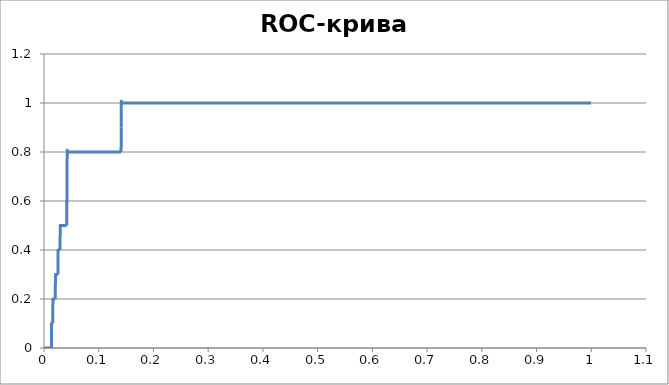
| Category | Чувствительность |
|---|---|
| 0.0 | 0 |
| 0.0002714440825190012 | 0 |
| 0.0005428881650380024 | 0 |
| 0.0008143322475570036 | 0 |
| 0.0010857763300760048 | 0 |
| 0.001357220412595006 | 0 |
| 0.0016286644951140072 | 0 |
| 0.0019001085776330084 | 0 |
| 0.0021715526601520097 | 0 |
| 0.002442996742671011 | 0 |
| 0.002714440825190012 | 0 |
| 0.0029858849077090133 | 0 |
| 0.0032573289902280145 | 0 |
| 0.0035287730727470157 | 0 |
| 0.003800217155266017 | 0 |
| 0.004071661237785018 | 0 |
| 0.004343105320304019 | 0 |
| 0.0046145494028230205 | 0 |
| 0.004885993485342022 | 0 |
| 0.005157437567861023 | 0 |
| 0.005428881650380024 | 0 |
| 0.005700325732899025 | 0 |
| 0.0059717698154180265 | 0 |
| 0.006243213897937028 | 0 |
| 0.006514657980456029 | 0 |
| 0.00678610206297503 | 0 |
| 0.007057546145494031 | 0 |
| 0.007328990228013033 | 0 |
| 0.007600434310532034 | 0 |
| 0.007871878393051035 | 0 |
| 0.008143322475570036 | 0 |
| 0.008414766558089037 | 0 |
| 0.008686210640608039 | 0 |
| 0.00895765472312704 | 0 |
| 0.009229098805646041 | 0 |
| 0.009500542888165042 | 0 |
| 0.009771986970684043 | 0 |
| 0.010043431053203045 | 0 |
| 0.010314875135722046 | 0 |
| 0.010586319218241047 | 0 |
| 0.010857763300760048 | 0 |
| 0.01112920738327905 | 0 |
| 0.01140065146579805 | 0 |
| 0.011672095548317052 | 0 |
| 0.011943539630836053 | 0 |
| 0.012214983713355054 | 0 |
| 0.012486427795874055 | 0 |
| 0.012757871878393057 | 0 |
| 0.013029315960912058 | 0 |
| 0.013300760043431059 | 0 |
| 0.01357220412595006 | 0 |
| 0.013843648208469062 | 0.1 |
| 0.013843648208469062 | 0.1 |
| 0.014115092290988063 | 0.1 |
| 0.014386536373507064 | 0.1 |
| 0.014657980456026065 | 0.1 |
| 0.014929424538545066 | 0.1 |
| 0.015200868621064068 | 0.1 |
| 0.015472312703583069 | 0.1 |
| 0.01574375678610207 | 0.1 |
| 0.01601520086862107 | 0.1 |
| 0.016286644951140072 | 0.2 |
| 0.016286644951140072 | 0.2 |
| 0.016558089033659074 | 0.2 |
| 0.016829533116178075 | 0.2 |
| 0.017100977198697076 | 0.2 |
| 0.017372421281216077 | 0.2 |
| 0.01764386536373508 | 0.2 |
| 0.01791530944625408 | 0.2 |
| 0.01818675352877308 | 0.2 |
| 0.018458197611292082 | 0.2 |
| 0.018729641693811083 | 0.2 |
| 0.019001085776330084 | 0.2 |
| 0.019272529858849086 | 0.2 |
| 0.019543973941368087 | 0.2 |
| 0.019815418023887088 | 0.2 |
| 0.02008686210640609 | 0.2 |
| 0.02035830618892509 | 0.2 |
| 0.02062975027144409 | 0.2 |
| 0.020901194353963093 | 0.3 |
| 0.020901194353963093 | 0.3 |
| 0.021172638436482094 | 0.3 |
| 0.021444082519001095 | 0.3 |
| 0.021715526601520097 | 0.3 |
| 0.021986970684039098 | 0.3 |
| 0.0222584147665581 | 0.3 |
| 0.0225298588490771 | 0.3 |
| 0.0228013029315961 | 0.3 |
| 0.023072747014115103 | 0.3 |
| 0.023344191096634104 | 0.3 |
| 0.023615635179153105 | 0.3 |
| 0.023887079261672106 | 0.3 |
| 0.024158523344191107 | 0.3 |
| 0.02442996742671011 | 0.3 |
| 0.02470141150922911 | 0.3 |
| 0.02497285559174811 | 0.3 |
| 0.025244299674267112 | 0.3 |
| 0.025515743756786113 | 0.3 |
| 0.025787187839305115 | 0.4 |
| 0.025787187839305115 | 0.4 |
| 0.026058631921824116 | 0.4 |
| 0.026330076004343117 | 0.4 |
| 0.026601520086862118 | 0.4 |
| 0.02687296416938112 | 0.4 |
| 0.02714440825190012 | 0.4 |
| 0.027415852334419122 | 0.4 |
| 0.027687296416938123 | 0.4 |
| 0.027958740499457124 | 0.4 |
| 0.028230184581976125 | 0.4 |
| 0.028501628664495127 | 0.4 |
| 0.028773072747014128 | 0.4 |
| 0.02904451682953313 | 0.4 |
| 0.02931596091205213 | 0.4 |
| 0.02958740499457113 | 0.5 |
| 0.02958740499457113 | 0.5 |
| 0.029858849077090133 | 0.5 |
| 0.030130293159609134 | 0.5 |
| 0.030401737242128135 | 0.5 |
| 0.030673181324647136 | 0.5 |
| 0.030944625407166138 | 0.5 |
| 0.03121606948968514 | 0.5 |
| 0.03148751357220414 | 0.5 |
| 0.03175895765472314 | 0.5 |
| 0.03203040173724214 | 0.5 |
| 0.032301845819761144 | 0.5 |
| 0.032573289902280145 | 0.5 |
| 0.032844733984799146 | 0.5 |
| 0.03311617806731815 | 0.5 |
| 0.03338762214983715 | 0.5 |
| 0.03365906623235615 | 0.5 |
| 0.03393051031487515 | 0.5 |
| 0.03420195439739415 | 0.5 |
| 0.03447339847991315 | 0.5 |
| 0.034744842562432154 | 0.5 |
| 0.035016286644951156 | 0.5 |
| 0.03528773072747016 | 0.5 |
| 0.03555917480998916 | 0.5 |
| 0.03583061889250816 | 0.5 |
| 0.03610206297502716 | 0.5 |
| 0.03637350705754616 | 0.5 |
| 0.03664495114006516 | 0.5 |
| 0.036916395222584164 | 0.5 |
| 0.037187839305103165 | 0.5 |
| 0.037459283387622166 | 0.5 |
| 0.03773072747014117 | 0.5 |
| 0.03800217155266017 | 0.5 |
| 0.03827361563517917 | 0.5 |
| 0.03854505971769817 | 0.5 |
| 0.03881650380021717 | 0.5 |
| 0.039087947882736174 | 0.5 |
| 0.039359391965255175 | 0.5 |
| 0.039630836047774176 | 0.5 |
| 0.03990228013029318 | 0.5 |
| 0.04017372421281218 | 0.5 |
| 0.04044516829533118 | 0.5 |
| 0.04071661237785018 | 0.5 |
| 0.04098805646036918 | 0.5 |
| 0.04125950054288818 | 0.5 |
| 0.041530944625407185 | 0.5 |
| 0.041802388707926186 | 0.6 |
| 0.041802388707926186 | 0.6 |
| 0.04207383279044519 | 0.7 |
| 0.04207383279044519 | 0.7 |
| 0.04234527687296419 | 0.8 |
| 0.04234527687296419 | 0.8 |
| 0.04261672095548319 | 0.8 |
| 0.04288816503800219 | 0.8 |
| 0.04315960912052119 | 0.8 |
| 0.04343105320304019 | 0.8 |
| 0.043702497285559194 | 0.8 |
| 0.043973941368078195 | 0.8 |
| 0.0442453854505972 | 0.8 |
| 0.0445168295331162 | 0.8 |
| 0.0447882736156352 | 0.8 |
| 0.0450597176981542 | 0.8 |
| 0.0453311617806732 | 0.8 |
| 0.0456026058631922 | 0.8 |
| 0.045874049945711204 | 0.8 |
| 0.046145494028230205 | 0.8 |
| 0.046416938110749206 | 0.8 |
| 0.04668838219326821 | 0.8 |
| 0.04695982627578721 | 0.8 |
| 0.04723127035830621 | 0.8 |
| 0.04750271444082521 | 0.8 |
| 0.04777415852334421 | 0.8 |
| 0.048045602605863214 | 0.8 |
| 0.048317046688382215 | 0.8 |
| 0.048588490770901216 | 0.8 |
| 0.04885993485342022 | 0.8 |
| 0.04913137893593922 | 0.8 |
| 0.04940282301845822 | 0.8 |
| 0.04967426710097722 | 0.8 |
| 0.04994571118349622 | 0.8 |
| 0.05021715526601522 | 0.8 |
| 0.050488599348534224 | 0.8 |
| 0.050760043431053226 | 0.8 |
| 0.05103148751357223 | 0.8 |
| 0.05130293159609123 | 0.8 |
| 0.05157437567861023 | 0.8 |
| 0.05184581976112923 | 0.8 |
| 0.05211726384364823 | 0.8 |
| 0.05238870792616723 | 0.8 |
| 0.052660152008686234 | 0.8 |
| 0.052931596091205235 | 0.8 |
| 0.053203040173724236 | 0.8 |
| 0.05347448425624324 | 0.8 |
| 0.05374592833876224 | 0.8 |
| 0.05401737242128124 | 0.8 |
| 0.05428881650380024 | 0.8 |
| 0.05456026058631924 | 0.8 |
| 0.054831704668838244 | 0.8 |
| 0.055103148751357245 | 0.8 |
| 0.055374592833876246 | 0.8 |
| 0.05564603691639525 | 0.8 |
| 0.05591748099891425 | 0.8 |
| 0.05618892508143325 | 0.8 |
| 0.05646036916395225 | 0.8 |
| 0.05673181324647125 | 0.8 |
| 0.05700325732899025 | 0.8 |
| 0.057274701411509255 | 0.8 |
| 0.057546145494028256 | 0.8 |
| 0.05781758957654726 | 0.8 |
| 0.05808903365906626 | 0.8 |
| 0.05836047774158526 | 0.8 |
| 0.05863192182410426 | 0.8 |
| 0.05890336590662326 | 0.8 |
| 0.05917480998914226 | 0.8 |
| 0.059446254071661264 | 0.8 |
| 0.059717698154180265 | 0.8 |
| 0.05998914223669927 | 0.8 |
| 0.06026058631921827 | 0.8 |
| 0.06053203040173727 | 0.8 |
| 0.06080347448425627 | 0.8 |
| 0.06107491856677527 | 0.8 |
| 0.06134636264929427 | 0.8 |
| 0.061617806731813274 | 0.8 |
| 0.061889250814332275 | 0.8 |
| 0.062160694896851276 | 0.8 |
| 0.06243213897937028 | 0.8 |
| 0.06270358306188928 | 0.8 |
| 0.06297502714440828 | 0.8 |
| 0.06324647122692728 | 0.8 |
| 0.06351791530944628 | 0.8 |
| 0.06378935939196528 | 0.8 |
| 0.06406080347448428 | 0.8 |
| 0.06433224755700329 | 0.8 |
| 0.06460369163952229 | 0.8 |
| 0.06487513572204129 | 0.8 |
| 0.06514657980456029 | 0.8 |
| 0.06541802388707929 | 0.8 |
| 0.06568946796959829 | 0.8 |
| 0.0659609120521173 | 0.8 |
| 0.0662323561346363 | 0.8 |
| 0.0665038002171553 | 0.8 |
| 0.0667752442996743 | 0.8 |
| 0.0670466883821933 | 0.8 |
| 0.0673181324647123 | 0.8 |
| 0.0675895765472313 | 0.8 |
| 0.0678610206297503 | 0.8 |
| 0.0681324647122693 | 0.8 |
| 0.0684039087947883 | 0.8 |
| 0.0686753528773073 | 0.8 |
| 0.0689467969598263 | 0.8 |
| 0.06921824104234531 | 0.8 |
| 0.06948968512486431 | 0.8 |
| 0.06976112920738331 | 0.8 |
| 0.07003257328990231 | 0.8 |
| 0.07030401737242131 | 0.8 |
| 0.07057546145494031 | 0.8 |
| 0.07084690553745931 | 0.8 |
| 0.07111834961997832 | 0.8 |
| 0.07138979370249732 | 0.8 |
| 0.07166123778501632 | 0.8 |
| 0.07193268186753532 | 0.8 |
| 0.07220412595005432 | 0.8 |
| 0.07247557003257332 | 0.8 |
| 0.07274701411509232 | 0.8 |
| 0.07301845819761132 | 0.8 |
| 0.07328990228013033 | 0.8 |
| 0.07356134636264933 | 0.8 |
| 0.07383279044516833 | 0.8 |
| 0.07410423452768733 | 0.8 |
| 0.07437567861020633 | 0.8 |
| 0.07464712269272533 | 0.8 |
| 0.07491856677524433 | 0.8 |
| 0.07519001085776333 | 0.8 |
| 0.07546145494028234 | 0.8 |
| 0.07573289902280134 | 0.8 |
| 0.07600434310532034 | 0.8 |
| 0.07627578718783934 | 0.8 |
| 0.07654723127035834 | 0.8 |
| 0.07681867535287734 | 0.8 |
| 0.07709011943539634 | 0.8 |
| 0.07736156351791534 | 0.8 |
| 0.07763300760043435 | 0.8 |
| 0.07790445168295335 | 0.8 |
| 0.07817589576547235 | 0.8 |
| 0.07844733984799135 | 0.8 |
| 0.07871878393051035 | 0.8 |
| 0.07899022801302935 | 0.8 |
| 0.07926167209554835 | 0.8 |
| 0.07953311617806735 | 0.8 |
| 0.07980456026058635 | 0.8 |
| 0.08007600434310536 | 0.8 |
| 0.08034744842562436 | 0.8 |
| 0.08061889250814336 | 0.8 |
| 0.08089033659066236 | 0.8 |
| 0.08116178067318136 | 0.8 |
| 0.08143322475570036 | 0.8 |
| 0.08170466883821936 | 0.8 |
| 0.08197611292073836 | 0.8 |
| 0.08224755700325737 | 0.8 |
| 0.08251900108577637 | 0.8 |
| 0.08279044516829537 | 0.8 |
| 0.08306188925081437 | 0.8 |
| 0.08333333333333337 | 0.8 |
| 0.08360477741585237 | 0.8 |
| 0.08387622149837137 | 0.8 |
| 0.08414766558089037 | 0.8 |
| 0.08441910966340938 | 0.8 |
| 0.08469055374592838 | 0.8 |
| 0.08496199782844738 | 0.8 |
| 0.08523344191096638 | 0.8 |
| 0.08550488599348538 | 0.8 |
| 0.08577633007600438 | 0.8 |
| 0.08604777415852338 | 0.8 |
| 0.08631921824104238 | 0.8 |
| 0.08659066232356138 | 0.8 |
| 0.08686210640608039 | 0.8 |
| 0.08713355048859939 | 0.8 |
| 0.08740499457111839 | 0.8 |
| 0.08767643865363739 | 0.8 |
| 0.08794788273615639 | 0.8 |
| 0.08821932681867539 | 0.8 |
| 0.0884907709011944 | 0.8 |
| 0.0887622149837134 | 0.8 |
| 0.0890336590662324 | 0.8 |
| 0.0893051031487514 | 0.8 |
| 0.0895765472312704 | 0.8 |
| 0.0898479913137894 | 0.8 |
| 0.0901194353963084 | 0.8 |
| 0.0903908794788274 | 0.8 |
| 0.0906623235613464 | 0.8 |
| 0.0909337676438654 | 0.8 |
| 0.0912052117263844 | 0.8 |
| 0.0914766558089034 | 0.8 |
| 0.09174809989142241 | 0.8 |
| 0.09201954397394141 | 0.8 |
| 0.09229098805646041 | 0.8 |
| 0.09256243213897941 | 0.8 |
| 0.09283387622149841 | 0.8 |
| 0.09310532030401741 | 0.8 |
| 0.09337676438653641 | 0.8 |
| 0.09364820846905542 | 0.8 |
| 0.09391965255157442 | 0.8 |
| 0.09419109663409342 | 0.8 |
| 0.09446254071661242 | 0.8 |
| 0.09473398479913142 | 0.8 |
| 0.09500542888165042 | 0.8 |
| 0.09527687296416942 | 0.8 |
| 0.09554831704668842 | 0.8 |
| 0.09581976112920743 | 0.8 |
| 0.09609120521172643 | 0.8 |
| 0.09636264929424543 | 0.8 |
| 0.09663409337676443 | 0.8 |
| 0.09690553745928343 | 0.8 |
| 0.09717698154180243 | 0.8 |
| 0.09744842562432143 | 0.8 |
| 0.09771986970684043 | 0.8 |
| 0.09799131378935944 | 0.8 |
| 0.09826275787187844 | 0.8 |
| 0.09853420195439744 | 0.8 |
| 0.09880564603691644 | 0.8 |
| 0.09907709011943544 | 0.8 |
| 0.09934853420195444 | 0.8 |
| 0.09961997828447344 | 0.8 |
| 0.09989142236699244 | 0.8 |
| 0.10016286644951145 | 0.8 |
| 0.10043431053203045 | 0.8 |
| 0.10070575461454945 | 0.8 |
| 0.10097719869706845 | 0.8 |
| 0.10124864277958745 | 0.8 |
| 0.10152008686210645 | 0.8 |
| 0.10179153094462545 | 0.8 |
| 0.10206297502714445 | 0.8 |
| 0.10233441910966345 | 0.8 |
| 0.10260586319218246 | 0.8 |
| 0.10287730727470146 | 0.8 |
| 0.10314875135722046 | 0.8 |
| 0.10342019543973946 | 0.8 |
| 0.10369163952225846 | 0.8 |
| 0.10396308360477746 | 0.8 |
| 0.10423452768729646 | 0.8 |
| 0.10450597176981546 | 0.8 |
| 0.10477741585233447 | 0.8 |
| 0.10504885993485347 | 0.8 |
| 0.10532030401737247 | 0.8 |
| 0.10559174809989147 | 0.8 |
| 0.10586319218241047 | 0.8 |
| 0.10613463626492947 | 0.8 |
| 0.10640608034744847 | 0.8 |
| 0.10667752442996747 | 0.8 |
| 0.10694896851248648 | 0.8 |
| 0.10722041259500548 | 0.8 |
| 0.10749185667752448 | 0.8 |
| 0.10776330076004348 | 0.8 |
| 0.10803474484256248 | 0.8 |
| 0.10830618892508148 | 0.8 |
| 0.10857763300760048 | 0.8 |
| 0.10884907709011948 | 0.8 |
| 0.10912052117263848 | 0.8 |
| 0.10939196525515749 | 0.8 |
| 0.10966340933767649 | 0.8 |
| 0.10993485342019549 | 0.8 |
| 0.11020629750271449 | 0.8 |
| 0.11047774158523349 | 0.8 |
| 0.11074918566775249 | 0.8 |
| 0.1110206297502715 | 0.8 |
| 0.1112920738327905 | 0.8 |
| 0.1115635179153095 | 0.8 |
| 0.1118349619978285 | 0.8 |
| 0.1121064060803475 | 0.8 |
| 0.1123778501628665 | 0.8 |
| 0.1126492942453855 | 0.8 |
| 0.1129207383279045 | 0.8 |
| 0.1131921824104235 | 0.8 |
| 0.1134636264929425 | 0.8 |
| 0.1137350705754615 | 0.8 |
| 0.1140065146579805 | 0.8 |
| 0.11427795874049951 | 0.8 |
| 0.11454940282301851 | 0.8 |
| 0.11482084690553751 | 0.8 |
| 0.11509229098805651 | 0.8 |
| 0.11536373507057551 | 0.8 |
| 0.11563517915309451 | 0.8 |
| 0.11590662323561352 | 0.8 |
| 0.11617806731813252 | 0.8 |
| 0.11644951140065152 | 0.8 |
| 0.11672095548317052 | 0.8 |
| 0.11699239956568952 | 0.8 |
| 0.11726384364820852 | 0.8 |
| 0.11753528773072752 | 0.8 |
| 0.11780673181324652 | 0.8 |
| 0.11807817589576552 | 0.8 |
| 0.11834961997828453 | 0.8 |
| 0.11862106406080353 | 0.8 |
| 0.11889250814332253 | 0.8 |
| 0.11916395222584153 | 0.8 |
| 0.11943539630836053 | 0.8 |
| 0.11970684039087953 | 0.8 |
| 0.11997828447339853 | 0.8 |
| 0.12024972855591753 | 0.8 |
| 0.12052117263843654 | 0.8 |
| 0.12079261672095554 | 0.8 |
| 0.12106406080347454 | 0.8 |
| 0.12133550488599354 | 0.8 |
| 0.12160694896851254 | 0.8 |
| 0.12187839305103154 | 0.8 |
| 0.12214983713355054 | 0.8 |
| 0.12242128121606954 | 0.8 |
| 0.12269272529858855 | 0.8 |
| 0.12296416938110755 | 0.8 |
| 0.12323561346362655 | 0.8 |
| 0.12350705754614555 | 0.8 |
| 0.12377850162866455 | 0.8 |
| 0.12404994571118355 | 0.8 |
| 0.12432138979370255 | 0.8 |
| 0.12459283387622155 | 0.8 |
| 0.12486427795874055 | 0.8 |
| 0.12513572204125945 | 0.8 |
| 0.12540716612377845 | 0.8 |
| 0.12567861020629745 | 0.8 |
| 0.12595005428881645 | 0.8 |
| 0.12622149837133545 | 0.8 |
| 0.12649294245385445 | 0.8 |
| 0.12676438653637345 | 0.8 |
| 0.12703583061889245 | 0.8 |
| 0.12730727470141145 | 0.8 |
| 0.12757871878393046 | 0.8 |
| 0.12785016286644946 | 0.8 |
| 0.12812160694896846 | 0.8 |
| 0.12839305103148746 | 0.8 |
| 0.12866449511400646 | 0.8 |
| 0.12893593919652546 | 0.8 |
| 0.12920738327904446 | 0.8 |
| 0.12947882736156346 | 0.8 |
| 0.12975027144408247 | 0.8 |
| 0.13002171552660147 | 0.8 |
| 0.13029315960912047 | 0.8 |
| 0.13056460369163947 | 0.8 |
| 0.13083604777415847 | 0.8 |
| 0.13110749185667747 | 0.8 |
| 0.13137893593919647 | 0.8 |
| 0.13165038002171547 | 0.8 |
| 0.13192182410423448 | 0.8 |
| 0.13219326818675348 | 0.8 |
| 0.13246471226927248 | 0.8 |
| 0.13273615635179148 | 0.8 |
| 0.13300760043431048 | 0.8 |
| 0.13327904451682948 | 0.8 |
| 0.13355048859934848 | 0.8 |
| 0.13382193268186748 | 0.8 |
| 0.13409337676438648 | 0.8 |
| 0.13436482084690549 | 0.8 |
| 0.1346362649294245 | 0.8 |
| 0.1349077090119435 | 0.8 |
| 0.1351791530944625 | 0.8 |
| 0.1354505971769815 | 0.8 |
| 0.1357220412595005 | 0.8 |
| 0.1359934853420195 | 0.8 |
| 0.1362649294245385 | 0.8 |
| 0.1365363735070575 | 0.8 |
| 0.1368078175895765 | 0.8 |
| 0.1370792616720955 | 0.8 |
| 0.1373507057546145 | 0.8 |
| 0.1376221498371335 | 0.8 |
| 0.1378935939196525 | 0.8 |
| 0.1381650380021715 | 0.8 |
| 0.1384364820846905 | 0.8 |
| 0.1387079261672095 | 0.8 |
| 0.1389793702497285 | 0.8 |
| 0.1392508143322475 | 0.8 |
| 0.1395222584147665 | 0.8 |
| 0.1397937024972855 | 0.8 |
| 0.1400651465798045 | 0.8 |
| 0.1403365906623235 | 0.8 |
| 0.1406080347448425 | 0.8 |
| 0.14087947882736152 | 0.8 |
| 0.14115092290988052 | 0.9 |
| 0.14115092290988052 | 1 |
| 0.14115092290988052 | 1 |
| 0.14142236699239952 | 1 |
| 0.14169381107491852 | 1 |
| 0.14196525515743752 | 1 |
| 0.14223669923995652 | 1 |
| 0.14250814332247552 | 1 |
| 0.14277958740499452 | 1 |
| 0.14305103148751352 | 1 |
| 0.14332247557003253 | 1 |
| 0.14359391965255153 | 1 |
| 0.14386536373507053 | 1 |
| 0.14413680781758953 | 1 |
| 0.14440825190010853 | 1 |
| 0.14467969598262753 | 1 |
| 0.14495114006514653 | 1 |
| 0.14522258414766553 | 1 |
| 0.14549402823018454 | 1 |
| 0.14576547231270354 | 1 |
| 0.14603691639522254 | 1 |
| 0.14630836047774154 | 1 |
| 0.14657980456026054 | 1 |
| 0.14685124864277954 | 1 |
| 0.14712269272529854 | 1 |
| 0.14739413680781754 | 1 |
| 0.14766558089033655 | 1 |
| 0.14793702497285555 | 1 |
| 0.14820846905537455 | 1 |
| 0.14847991313789355 | 1 |
| 0.14875135722041255 | 1 |
| 0.14902280130293155 | 1 |
| 0.14929424538545055 | 1 |
| 0.14956568946796955 | 1 |
| 0.14983713355048855 | 1 |
| 0.15010857763300756 | 1 |
| 0.15038002171552656 | 1 |
| 0.15065146579804556 | 1 |
| 0.15092290988056456 | 1 |
| 0.15119435396308356 | 1 |
| 0.15146579804560256 | 1 |
| 0.15173724212812156 | 1 |
| 0.15200868621064056 | 1 |
| 0.15228013029315957 | 1 |
| 0.15255157437567857 | 1 |
| 0.15282301845819757 | 1 |
| 0.15309446254071657 | 1 |
| 0.15336590662323557 | 1 |
| 0.15363735070575457 | 1 |
| 0.15390879478827357 | 1 |
| 0.15418023887079257 | 1 |
| 0.15445168295331158 | 1 |
| 0.15472312703583058 | 1 |
| 0.15499457111834958 | 1 |
| 0.15526601520086858 | 1 |
| 0.15553745928338758 | 1 |
| 0.15580890336590658 | 1 |
| 0.15608034744842558 | 1 |
| 0.15635179153094458 | 1 |
| 0.15662323561346359 | 1 |
| 0.1568946796959826 | 1 |
| 0.1571661237785016 | 1 |
| 0.1574375678610206 | 1 |
| 0.1577090119435396 | 1 |
| 0.1579804560260586 | 1 |
| 0.1582519001085776 | 1 |
| 0.1585233441910966 | 1 |
| 0.1587947882736156 | 1 |
| 0.1590662323561346 | 1 |
| 0.1593376764386536 | 1 |
| 0.1596091205211726 | 1 |
| 0.1598805646036916 | 1 |
| 0.1601520086862106 | 1 |
| 0.1604234527687296 | 1 |
| 0.1606948968512486 | 1 |
| 0.1609663409337676 | 1 |
| 0.1612377850162866 | 1 |
| 0.1615092290988056 | 1 |
| 0.1617806731813246 | 1 |
| 0.1620521172638436 | 1 |
| 0.1623235613463626 | 1 |
| 0.1625950054288816 | 1 |
| 0.1628664495114006 | 1 |
| 0.16313789359391961 | 1 |
| 0.16340933767643862 | 1 |
| 0.16368078175895762 | 1 |
| 0.16395222584147662 | 1 |
| 0.16422366992399562 | 1 |
| 0.16449511400651462 | 1 |
| 0.16476655808903362 | 1 |
| 0.16503800217155262 | 1 |
| 0.16530944625407162 | 1 |
| 0.16558089033659062 | 1 |
| 0.16585233441910963 | 1 |
| 0.16612377850162863 | 1 |
| 0.16639522258414763 | 1 |
| 0.16666666666666663 | 1 |
| 0.16693811074918563 | 1 |
| 0.16720955483170463 | 1 |
| 0.16748099891422363 | 1 |
| 0.16775244299674263 | 1 |
| 0.16802388707926164 | 1 |
| 0.16829533116178064 | 1 |
| 0.16856677524429964 | 1 |
| 0.16883821932681864 | 1 |
| 0.16910966340933764 | 1 |
| 0.16938110749185664 | 1 |
| 0.16965255157437564 | 1 |
| 0.16992399565689464 | 1 |
| 0.17019543973941365 | 1 |
| 0.17046688382193265 | 1 |
| 0.17073832790445165 | 1 |
| 0.17100977198697065 | 1 |
| 0.17128121606948965 | 1 |
| 0.17155266015200865 | 1 |
| 0.17182410423452765 | 1 |
| 0.17209554831704665 | 1 |
| 0.17236699239956565 | 1 |
| 0.17263843648208466 | 1 |
| 0.17290988056460366 | 1 |
| 0.17318132464712266 | 1 |
| 0.17345276872964166 | 1 |
| 0.17372421281216066 | 1 |
| 0.17399565689467966 | 1 |
| 0.17426710097719866 | 1 |
| 0.17453854505971766 | 1 |
| 0.17480998914223667 | 1 |
| 0.17508143322475567 | 1 |
| 0.17535287730727467 | 1 |
| 0.17562432138979367 | 1 |
| 0.17589576547231267 | 1 |
| 0.17616720955483167 | 1 |
| 0.17643865363735067 | 1 |
| 0.17671009771986967 | 1 |
| 0.17698154180238868 | 1 |
| 0.17725298588490768 | 1 |
| 0.17752442996742668 | 1 |
| 0.17779587404994568 | 1 |
| 0.17806731813246468 | 1 |
| 0.17833876221498368 | 1 |
| 0.17861020629750268 | 1 |
| 0.17888165038002168 | 1 |
| 0.17915309446254069 | 1 |
| 0.1794245385450597 | 1 |
| 0.1796959826275787 | 1 |
| 0.1799674267100977 | 1 |
| 0.1802388707926167 | 1 |
| 0.1805103148751357 | 1 |
| 0.1807817589576547 | 1 |
| 0.1810532030401737 | 1 |
| 0.1813246471226927 | 1 |
| 0.1815960912052117 | 1 |
| 0.1818675352877307 | 1 |
| 0.1821389793702497 | 1 |
| 0.1824104234527687 | 1 |
| 0.1826818675352877 | 1 |
| 0.1829533116178067 | 1 |
| 0.1832247557003257 | 1 |
| 0.1834961997828447 | 1 |
| 0.1837676438653637 | 1 |
| 0.1840390879478827 | 1 |
| 0.1843105320304017 | 1 |
| 0.1845819761129207 | 1 |
| 0.1848534201954397 | 1 |
| 0.1851248642779587 | 1 |
| 0.1853963083604777 | 1 |
| 0.18566775244299671 | 1 |
| 0.18593919652551572 | 1 |
| 0.18621064060803472 | 1 |
| 0.18648208469055372 | 1 |
| 0.18675352877307272 | 1 |
| 0.18702497285559172 | 1 |
| 0.18729641693811072 | 1 |
| 0.18756786102062972 | 1 |
| 0.18783930510314872 | 1 |
| 0.18811074918566772 | 1 |
| 0.18838219326818673 | 1 |
| 0.18865363735070573 | 1 |
| 0.18892508143322473 | 1 |
| 0.18919652551574373 | 1 |
| 0.18946796959826273 | 1 |
| 0.18973941368078173 | 1 |
| 0.19001085776330073 | 1 |
| 0.19028230184581973 | 1 |
| 0.19055374592833874 | 1 |
| 0.19082519001085774 | 1 |
| 0.19109663409337674 | 1 |
| 0.19136807817589574 | 1 |
| 0.19163952225841474 | 1 |
| 0.19191096634093374 | 1 |
| 0.19218241042345274 | 1 |
| 0.19245385450597174 | 1 |
| 0.19272529858849075 | 1 |
| 0.19299674267100975 | 1 |
| 0.19326818675352875 | 1 |
| 0.19353963083604775 | 1 |
| 0.19381107491856675 | 1 |
| 0.19408251900108575 | 1 |
| 0.19435396308360475 | 1 |
| 0.19462540716612375 | 1 |
| 0.19489685124864276 | 1 |
| 0.19516829533116176 | 1 |
| 0.19543973941368076 | 1 |
| 0.19571118349619976 | 1 |
| 0.19598262757871876 | 1 |
| 0.19625407166123776 | 1 |
| 0.19652551574375676 | 1 |
| 0.19679695982627576 | 1 |
| 0.19706840390879476 | 1 |
| 0.19733984799131377 | 1 |
| 0.19761129207383277 | 1 |
| 0.19788273615635177 | 1 |
| 0.19815418023887077 | 1 |
| 0.19842562432138977 | 1 |
| 0.19869706840390877 | 1 |
| 0.19896851248642777 | 1 |
| 0.19923995656894677 | 1 |
| 0.19951140065146578 | 1 |
| 0.19978284473398478 | 1 |
| 0.20005428881650378 | 1 |
| 0.20032573289902278 | 1 |
| 0.20059717698154178 | 1 |
| 0.20086862106406078 | 1 |
| 0.20114006514657978 | 1 |
| 0.20141150922909878 | 1 |
| 0.20168295331161779 | 1 |
| 0.2019543973941368 | 1 |
| 0.2022258414766558 | 1 |
| 0.2024972855591748 | 1 |
| 0.2027687296416938 | 1 |
| 0.2030401737242128 | 1 |
| 0.2033116178067318 | 1 |
| 0.2035830618892508 | 1 |
| 0.2038545059717698 | 1 |
| 0.2041259500542888 | 1 |
| 0.2043973941368078 | 1 |
| 0.2046688382193268 | 1 |
| 0.2049402823018458 | 1 |
| 0.2052117263843648 | 1 |
| 0.2054831704668838 | 1 |
| 0.2057546145494028 | 1 |
| 0.2060260586319218 | 1 |
| 0.2062975027144408 | 1 |
| 0.2065689467969598 | 1 |
| 0.2068403908794788 | 1 |
| 0.2071118349619978 | 1 |
| 0.2073832790445168 | 1 |
| 0.2076547231270358 | 1 |
| 0.2079261672095548 | 1 |
| 0.20819761129207381 | 1 |
| 0.20846905537459282 | 1 |
| 0.20874049945711182 | 1 |
| 0.20901194353963082 | 1 |
| 0.20928338762214982 | 1 |
| 0.20955483170466882 | 1 |
| 0.20982627578718782 | 1 |
| 0.21009771986970682 | 1 |
| 0.21036916395222582 | 1 |
| 0.21064060803474483 | 1 |
| 0.21091205211726383 | 1 |
| 0.21118349619978283 | 1 |
| 0.21145494028230183 | 1 |
| 0.21172638436482083 | 1 |
| 0.21199782844733983 | 1 |
| 0.21226927252985883 | 1 |
| 0.21254071661237783 | 1 |
| 0.21281216069489683 | 1 |
| 0.21308360477741584 | 1 |
| 0.21335504885993484 | 1 |
| 0.21362649294245384 | 1 |
| 0.21389793702497284 | 1 |
| 0.21416938110749184 | 1 |
| 0.21444082519001084 | 1 |
| 0.21471226927252984 | 1 |
| 0.21498371335504884 | 1 |
| 0.21525515743756785 | 1 |
| 0.21552660152008685 | 1 |
| 0.21579804560260585 | 1 |
| 0.21606948968512485 | 1 |
| 0.21634093376764385 | 1 |
| 0.21661237785016285 | 1 |
| 0.21688382193268185 | 1 |
| 0.21715526601520085 | 1 |
| 0.21742671009771986 | 1 |
| 0.21769815418023886 | 1 |
| 0.21796959826275786 | 1 |
| 0.21824104234527686 | 1 |
| 0.21851248642779586 | 1 |
| 0.21878393051031486 | 1 |
| 0.21905537459283386 | 1 |
| 0.21932681867535286 | 1 |
| 0.21959826275787186 | 1 |
| 0.21986970684039087 | 1 |
| 0.22014115092290987 | 1 |
| 0.22041259500542887 | 1 |
| 0.22068403908794787 | 1 |
| 0.22095548317046687 | 1 |
| 0.22122692725298587 | 1 |
| 0.22149837133550487 | 1 |
| 0.22176981541802387 | 1 |
| 0.22204125950054288 | 1 |
| 0.22231270358306188 | 1 |
| 0.22258414766558088 | 1 |
| 0.22285559174809988 | 1 |
| 0.22312703583061888 | 1 |
| 0.22339847991313788 | 1 |
| 0.22366992399565688 | 1 |
| 0.22394136807817588 | 1 |
| 0.22421281216069489 | 1 |
| 0.2244842562432139 | 1 |
| 0.2247557003257329 | 1 |
| 0.2250271444082519 | 1 |
| 0.2252985884907709 | 1 |
| 0.2255700325732899 | 1 |
| 0.2258414766558089 | 1 |
| 0.2261129207383279 | 1 |
| 0.2263843648208469 | 1 |
| 0.2266558089033659 | 1 |
| 0.2269272529858849 | 1 |
| 0.2271986970684039 | 1 |
| 0.2274701411509229 | 1 |
| 0.2277415852334419 | 1 |
| 0.2280130293159609 | 1 |
| 0.2282844733984799 | 1 |
| 0.2285559174809989 | 1 |
| 0.2288273615635179 | 1 |
| 0.2290988056460369 | 1 |
| 0.2293702497285559 | 1 |
| 0.2296416938110749 | 1 |
| 0.2299131378935939 | 1 |
| 0.2301845819761129 | 1 |
| 0.2304560260586319 | 1 |
| 0.23072747014115091 | 1 |
| 0.23099891422366992 | 1 |
| 0.23127035830618892 | 1 |
| 0.23154180238870792 | 1 |
| 0.23181324647122692 | 1 |
| 0.23208469055374592 | 1 |
| 0.23235613463626492 | 1 |
| 0.23262757871878392 | 1 |
| 0.23289902280130292 | 1 |
| 0.23317046688382193 | 1 |
| 0.23344191096634093 | 1 |
| 0.23371335504885993 | 1 |
| 0.23398479913137893 | 1 |
| 0.23425624321389793 | 1 |
| 0.23452768729641693 | 1 |
| 0.23479913137893593 | 1 |
| 0.23507057546145493 | 1 |
| 0.23534201954397393 | 1 |
| 0.23561346362649294 | 1 |
| 0.23588490770901194 | 1 |
| 0.23615635179153094 | 1 |
| 0.23642779587404994 | 1 |
| 0.23669923995656894 | 1 |
| 0.23697068403908794 | 1 |
| 0.23724212812160694 | 1 |
| 0.23751357220412594 | 1 |
| 0.23778501628664495 | 1 |
| 0.23805646036916395 | 1 |
| 0.23832790445168295 | 1 |
| 0.23859934853420195 | 1 |
| 0.23887079261672095 | 1 |
| 0.23914223669923995 | 1 |
| 0.23941368078175895 | 1 |
| 0.23968512486427795 | 1 |
| 0.23995656894679696 | 1 |
| 0.24022801302931596 | 1 |
| 0.24049945711183496 | 1 |
| 0.24077090119435396 | 1 |
| 0.24104234527687296 | 1 |
| 0.24131378935939196 | 1 |
| 0.24158523344191096 | 1 |
| 0.24185667752442996 | 1 |
| 0.24212812160694897 | 1 |
| 0.24239956568946797 | 1 |
| 0.24267100977198697 | 1 |
| 0.24294245385450597 | 1 |
| 0.24321389793702497 | 1 |
| 0.24348534201954397 | 1 |
| 0.24375678610206297 | 1 |
| 0.24402823018458197 | 1 |
| 0.24429967426710097 | 1 |
| 0.24457111834961998 | 1 |
| 0.24484256243213898 | 1 |
| 0.24511400651465798 | 1 |
| 0.24538545059717698 | 1 |
| 0.24565689467969598 | 1 |
| 0.24592833876221498 | 1 |
| 0.24619978284473398 | 1 |
| 0.24647122692725298 | 1 |
| 0.24674267100977199 | 1 |
| 0.247014115092291 | 1 |
| 0.24728555917481 | 1 |
| 0.247557003257329 | 1 |
| 0.247828447339848 | 1 |
| 0.248099891422367 | 1 |
| 0.248371335504886 | 1 |
| 0.248642779587405 | 1 |
| 0.248914223669924 | 1 |
| 0.249185667752443 | 1 |
| 0.249457111834962 | 1 |
| 0.249728555917481 | 1 |
| 0.25 | 1 |
| 0.250271444082519 | 1 |
| 0.250542888165038 | 1 |
| 0.250814332247557 | 1 |
| 0.251085776330076 | 1 |
| 0.251357220412595 | 1 |
| 0.251628664495114 | 1 |
| 0.251900108577633 | 1 |
| 0.252171552660152 | 1 |
| 0.252442996742671 | 1 |
| 0.25271444082519 | 1 |
| 0.252985884907709 | 1 |
| 0.253257328990228 | 1 |
| 0.253528773072747 | 1 |
| 0.253800217155266 | 1 |
| 0.254071661237785 | 1 |
| 0.254343105320304 | 1 |
| 0.254614549402823 | 1 |
| 0.254885993485342 | 1 |
| 0.255157437567861 | 1 |
| 0.25542888165038 | 1 |
| 0.255700325732899 | 1 |
| 0.255971769815418 | 1 |
| 0.256243213897937 | 1 |
| 0.25651465798045603 | 1 |
| 0.25678610206297503 | 1 |
| 0.25705754614549403 | 1 |
| 0.25732899022801303 | 1 |
| 0.25760043431053203 | 1 |
| 0.25787187839305103 | 1 |
| 0.25814332247557004 | 1 |
| 0.25841476655808904 | 1 |
| 0.25868621064060804 | 1 |
| 0.25895765472312704 | 1 |
| 0.25922909880564604 | 1 |
| 0.25950054288816504 | 1 |
| 0.25977198697068404 | 1 |
| 0.26004343105320304 | 1 |
| 0.26031487513572205 | 1 |
| 0.26058631921824105 | 1 |
| 0.26085776330076005 | 1 |
| 0.26112920738327905 | 1 |
| 0.26140065146579805 | 1 |
| 0.26167209554831705 | 1 |
| 0.26194353963083605 | 1 |
| 0.26221498371335505 | 1 |
| 0.26248642779587406 | 1 |
| 0.26275787187839306 | 1 |
| 0.26302931596091206 | 1 |
| 0.26330076004343106 | 1 |
| 0.26357220412595006 | 1 |
| 0.26384364820846906 | 1 |
| 0.26411509229098806 | 1 |
| 0.26438653637350706 | 1 |
| 0.26465798045602607 | 1 |
| 0.26492942453854507 | 1 |
| 0.26520086862106407 | 1 |
| 0.26547231270358307 | 1 |
| 0.26574375678610207 | 1 |
| 0.26601520086862107 | 1 |
| 0.2662866449511401 | 1 |
| 0.2665580890336591 | 1 |
| 0.2668295331161781 | 1 |
| 0.2671009771986971 | 1 |
| 0.2673724212812161 | 1 |
| 0.2676438653637351 | 1 |
| 0.2679153094462541 | 1 |
| 0.2681867535287731 | 1 |
| 0.2684581976112921 | 1 |
| 0.2687296416938111 | 1 |
| 0.2690010857763301 | 1 |
| 0.2692725298588491 | 1 |
| 0.2695439739413681 | 1 |
| 0.2698154180238871 | 1 |
| 0.2700868621064061 | 1 |
| 0.2703583061889251 | 1 |
| 0.2706297502714441 | 1 |
| 0.2709011943539631 | 1 |
| 0.2711726384364821 | 1 |
| 0.2714440825190011 | 1 |
| 0.2717155266015201 | 1 |
| 0.2719869706840391 | 1 |
| 0.2722584147665581 | 1 |
| 0.2725298588490771 | 1 |
| 0.2728013029315961 | 1 |
| 0.2730727470141151 | 1 |
| 0.2733441910966341 | 1 |
| 0.2736156351791531 | 1 |
| 0.2738870792616721 | 1 |
| 0.2741585233441911 | 1 |
| 0.2744299674267101 | 1 |
| 0.2747014115092291 | 1 |
| 0.2749728555917481 | 1 |
| 0.2752442996742671 | 1 |
| 0.2755157437567861 | 1 |
| 0.2757871878393051 | 1 |
| 0.2760586319218241 | 1 |
| 0.2763300760043431 | 1 |
| 0.2766015200868621 | 1 |
| 0.2768729641693811 | 1 |
| 0.2771444082519001 | 1 |
| 0.2774158523344191 | 1 |
| 0.2776872964169381 | 1 |
| 0.2779587404994571 | 1 |
| 0.2782301845819761 | 1 |
| 0.2785016286644951 | 1 |
| 0.27877307274701413 | 1 |
| 0.27904451682953313 | 1 |
| 0.27931596091205213 | 1 |
| 0.27958740499457113 | 1 |
| 0.27985884907709013 | 1 |
| 0.28013029315960913 | 1 |
| 0.28040173724212814 | 1 |
| 0.28067318132464714 | 1 |
| 0.28094462540716614 | 1 |
| 0.28121606948968514 | 1 |
| 0.28148751357220414 | 1 |
| 0.28175895765472314 | 1 |
| 0.28203040173724214 | 1 |
| 0.28230184581976114 | 1 |
| 0.28257328990228014 | 1 |
| 0.28284473398479915 | 1 |
| 0.28311617806731815 | 1 |
| 0.28338762214983715 | 1 |
| 0.28365906623235615 | 1 |
| 0.28393051031487515 | 1 |
| 0.28420195439739415 | 1 |
| 0.28447339847991315 | 1 |
| 0.28474484256243215 | 1 |
| 0.28501628664495116 | 1 |
| 0.28528773072747016 | 1 |
| 0.28555917480998916 | 1 |
| 0.28583061889250816 | 1 |
| 0.28610206297502716 | 1 |
| 0.28637350705754616 | 1 |
| 0.28664495114006516 | 1 |
| 0.28691639522258416 | 1 |
| 0.28718783930510317 | 1 |
| 0.28745928338762217 | 1 |
| 0.28773072747014117 | 1 |
| 0.28800217155266017 | 1 |
| 0.28827361563517917 | 1 |
| 0.28854505971769817 | 1 |
| 0.2888165038002172 | 1 |
| 0.2890879478827362 | 1 |
| 0.2893593919652552 | 1 |
| 0.2896308360477742 | 1 |
| 0.2899022801302932 | 1 |
| 0.2901737242128122 | 1 |
| 0.2904451682953312 | 1 |
| 0.2907166123778502 | 1 |
| 0.2909880564603692 | 1 |
| 0.2912595005428882 | 1 |
| 0.2915309446254072 | 1 |
| 0.2918023887079262 | 1 |
| 0.2920738327904452 | 1 |
| 0.2923452768729642 | 1 |
| 0.2926167209554832 | 1 |
| 0.2928881650380022 | 1 |
| 0.2931596091205212 | 1 |
| 0.2934310532030402 | 1 |
| 0.2937024972855592 | 1 |
| 0.2939739413680782 | 1 |
| 0.2942453854505972 | 1 |
| 0.2945168295331162 | 1 |
| 0.2947882736156352 | 1 |
| 0.2950597176981542 | 1 |
| 0.2953311617806732 | 1 |
| 0.2956026058631922 | 1 |
| 0.2958740499457112 | 1 |
| 0.2961454940282302 | 1 |
| 0.2964169381107492 | 1 |
| 0.2966883821932682 | 1 |
| 0.2969598262757872 | 1 |
| 0.2972312703583062 | 1 |
| 0.2975027144408252 | 1 |
| 0.2977741585233442 | 1 |
| 0.2980456026058632 | 1 |
| 0.2983170466883822 | 1 |
| 0.2985884907709012 | 1 |
| 0.2988599348534202 | 1 |
| 0.2991313789359392 | 1 |
| 0.2994028230184582 | 1 |
| 0.2996742671009772 | 1 |
| 0.2999457111834962 | 1 |
| 0.3002171552660152 | 1 |
| 0.3004885993485342 | 1 |
| 0.3007600434310532 | 1 |
| 0.3010314875135722 | 1 |
| 0.30130293159609123 | 1 |
| 0.30157437567861023 | 1 |
| 0.30184581976112923 | 1 |
| 0.30211726384364823 | 1 |
| 0.30238870792616723 | 1 |
| 0.30266015200868623 | 1 |
| 0.30293159609120524 | 1 |
| 0.30320304017372424 | 1 |
| 0.30347448425624324 | 1 |
| 0.30374592833876224 | 1 |
| 0.30401737242128124 | 1 |
| 0.30428881650380024 | 1 |
| 0.30456026058631924 | 1 |
| 0.30483170466883824 | 1 |
| 0.30510314875135724 | 1 |
| 0.30537459283387625 | 1 |
| 0.30564603691639525 | 1 |
| 0.30591748099891425 | 1 |
| 0.30618892508143325 | 1 |
| 0.30646036916395225 | 1 |
| 0.30673181324647125 | 1 |
| 0.30700325732899025 | 1 |
| 0.30727470141150925 | 1 |
| 0.30754614549402826 | 1 |
| 0.30781758957654726 | 1 |
| 0.30808903365906626 | 1 |
| 0.30836047774158526 | 1 |
| 0.30863192182410426 | 1 |
| 0.30890336590662326 | 1 |
| 0.30917480998914226 | 1 |
| 0.30944625407166126 | 1 |
| 0.30971769815418027 | 1 |
| 0.30998914223669927 | 1 |
| 0.31026058631921827 | 1 |
| 0.31053203040173727 | 1 |
| 0.31080347448425627 | 1 |
| 0.31107491856677527 | 1 |
| 0.3113463626492943 | 1 |
| 0.3116178067318133 | 1 |
| 0.3118892508143323 | 1 |
| 0.3121606948968513 | 1 |
| 0.3124321389793703 | 1 |
| 0.3127035830618893 | 1 |
| 0.3129750271444083 | 1 |
| 0.3132464712269273 | 1 |
| 0.3135179153094463 | 1 |
| 0.3137893593919653 | 1 |
| 0.3140608034744843 | 1 |
| 0.3143322475570033 | 1 |
| 0.3146036916395223 | 1 |
| 0.3148751357220413 | 1 |
| 0.3151465798045603 | 1 |
| 0.3154180238870793 | 1 |
| 0.3156894679695983 | 1 |
| 0.3159609120521173 | 1 |
| 0.3162323561346363 | 1 |
| 0.3165038002171553 | 1 |
| 0.3167752442996743 | 1 |
| 0.3170466883821933 | 1 |
| 0.3173181324647123 | 1 |
| 0.3175895765472313 | 1 |
| 0.3178610206297503 | 1 |
| 0.3181324647122693 | 1 |
| 0.3184039087947883 | 1 |
| 0.3186753528773073 | 1 |
| 0.3189467969598263 | 1 |
| 0.3192182410423453 | 1 |
| 0.3194896851248643 | 1 |
| 0.3197611292073833 | 1 |
| 0.3200325732899023 | 1 |
| 0.3203040173724213 | 1 |
| 0.3205754614549403 | 1 |
| 0.3208469055374593 | 1 |
| 0.3211183496199783 | 1 |
| 0.3213897937024973 | 1 |
| 0.3216612377850163 | 1 |
| 0.3219326818675353 | 1 |
| 0.3222041259500543 | 1 |
| 0.3224755700325733 | 1 |
| 0.3227470141150923 | 1 |
| 0.3230184581976113 | 1 |
| 0.3232899022801303 | 1 |
| 0.3235613463626493 | 1 |
| 0.32383279044516833 | 1 |
| 0.32410423452768733 | 1 |
| 0.32437567861020633 | 1 |
| 0.32464712269272533 | 1 |
| 0.32491856677524433 | 1 |
| 0.32519001085776333 | 1 |
| 0.32546145494028234 | 1 |
| 0.32573289902280134 | 1 |
| 0.32600434310532034 | 1 |
| 0.32627578718783934 | 1 |
| 0.32654723127035834 | 1 |
| 0.32681867535287734 | 1 |
| 0.32709011943539634 | 1 |
| 0.32736156351791534 | 1 |
| 0.32763300760043435 | 1 |
| 0.32790445168295335 | 1 |
| 0.32817589576547235 | 1 |
| 0.32844733984799135 | 1 |
| 0.32871878393051035 | 1 |
| 0.32899022801302935 | 1 |
| 0.32926167209554835 | 1 |
| 0.32953311617806735 | 1 |
| 0.32980456026058635 | 1 |
| 0.33007600434310536 | 1 |
| 0.33034744842562436 | 1 |
| 0.33061889250814336 | 1 |
| 0.33089033659066236 | 1 |
| 0.33116178067318136 | 1 |
| 0.33143322475570036 | 1 |
| 0.33170466883821936 | 1 |
| 0.33197611292073836 | 1 |
| 0.33224755700325737 | 1 |
| 0.33251900108577637 | 1 |
| 0.33279044516829537 | 1 |
| 0.33306188925081437 | 1 |
| 0.33333333333333337 | 1 |
| 0.33360477741585237 | 1 |
| 0.3338762214983714 | 1 |
| 0.3341476655808904 | 1 |
| 0.3344191096634094 | 1 |
| 0.3346905537459284 | 1 |
| 0.3349619978284474 | 1 |
| 0.3352334419109664 | 1 |
| 0.3355048859934854 | 1 |
| 0.3357763300760044 | 1 |
| 0.3360477741585234 | 1 |
| 0.3363192182410424 | 1 |
| 0.3365906623235614 | 1 |
| 0.3368621064060804 | 1 |
| 0.3371335504885994 | 1 |
| 0.3374049945711184 | 1 |
| 0.3376764386536374 | 1 |
| 0.3379478827361564 | 1 |
| 0.3382193268186754 | 1 |
| 0.3384907709011944 | 1 |
| 0.3387622149837134 | 1 |
| 0.3390336590662324 | 1 |
| 0.3393051031487514 | 1 |
| 0.3395765472312704 | 1 |
| 0.3398479913137894 | 1 |
| 0.3401194353963084 | 1 |
| 0.3403908794788274 | 1 |
| 0.3406623235613464 | 1 |
| 0.3409337676438654 | 1 |
| 0.3412052117263844 | 1 |
| 0.3414766558089034 | 1 |
| 0.3417480998914224 | 1 |
| 0.3420195439739414 | 1 |
| 0.3422909880564604 | 1 |
| 0.3425624321389794 | 1 |
| 0.3428338762214984 | 1 |
| 0.3431053203040174 | 1 |
| 0.3433767643865364 | 1 |
| 0.3436482084690554 | 1 |
| 0.3439196525515744 | 1 |
| 0.3441910966340934 | 1 |
| 0.3444625407166124 | 1 |
| 0.3447339847991314 | 1 |
| 0.3450054288816504 | 1 |
| 0.3452768729641694 | 1 |
| 0.3455483170466884 | 1 |
| 0.3458197611292074 | 1 |
| 0.3460912052117264 | 1 |
| 0.34636264929424543 | 1 |
| 0.34663409337676443 | 1 |
| 0.34690553745928343 | 1 |
| 0.34717698154180243 | 1 |
| 0.34744842562432143 | 1 |
| 0.34771986970684043 | 1 |
| 0.34799131378935944 | 1 |
| 0.34826275787187844 | 1 |
| 0.34853420195439744 | 1 |
| 0.34880564603691644 | 1 |
| 0.34907709011943544 | 1 |
| 0.34934853420195444 | 1 |
| 0.34961997828447344 | 1 |
| 0.34989142236699244 | 1 |
| 0.35016286644951145 | 1 |
| 0.35043431053203045 | 1 |
| 0.35070575461454945 | 1 |
| 0.35097719869706845 | 1 |
| 0.35124864277958745 | 1 |
| 0.35152008686210645 | 1 |
| 0.35179153094462545 | 1 |
| 0.35206297502714445 | 1 |
| 0.35233441910966345 | 1 |
| 0.35260586319218246 | 1 |
| 0.35287730727470146 | 1 |
| 0.35314875135722046 | 1 |
| 0.35342019543973946 | 1 |
| 0.35369163952225846 | 1 |
| 0.35396308360477746 | 1 |
| 0.35423452768729646 | 1 |
| 0.35450597176981546 | 1 |
| 0.35477741585233447 | 1 |
| 0.35504885993485347 | 1 |
| 0.35532030401737247 | 1 |
| 0.35559174809989147 | 1 |
| 0.35586319218241047 | 1 |
| 0.35613463626492947 | 1 |
| 0.3564060803474485 | 1 |
| 0.3566775244299675 | 1 |
| 0.3569489685124865 | 1 |
| 0.3572204125950055 | 1 |
| 0.3574918566775245 | 1 |
| 0.3577633007600435 | 1 |
| 0.3580347448425625 | 1 |
| 0.3583061889250815 | 1 |
| 0.3585776330076005 | 1 |
| 0.3588490770901195 | 1 |
| 0.3591205211726385 | 1 |
| 0.3593919652551575 | 1 |
| 0.3596634093376765 | 1 |
| 0.3599348534201955 | 1 |
| 0.3602062975027145 | 1 |
| 0.3604777415852335 | 1 |
| 0.3607491856677525 | 1 |
| 0.3610206297502715 | 1 |
| 0.3612920738327905 | 1 |
| 0.3615635179153095 | 1 |
| 0.3618349619978285 | 1 |
| 0.3621064060803475 | 1 |
| 0.3623778501628665 | 1 |
| 0.3626492942453855 | 1 |
| 0.3629207383279045 | 1 |
| 0.3631921824104235 | 1 |
| 0.3634636264929425 | 1 |
| 0.3637350705754615 | 1 |
| 0.3640065146579805 | 1 |
| 0.3642779587404995 | 1 |
| 0.3645494028230185 | 1 |
| 0.3648208469055375 | 1 |
| 0.3650922909880565 | 1 |
| 0.3653637350705755 | 1 |
| 0.3656351791530945 | 1 |
| 0.3659066232356135 | 1 |
| 0.3661780673181325 | 1 |
| 0.3664495114006515 | 1 |
| 0.3667209554831705 | 1 |
| 0.3669923995656895 | 1 |
| 0.3672638436482085 | 1 |
| 0.3675352877307275 | 1 |
| 0.3678067318132465 | 1 |
| 0.3680781758957655 | 1 |
| 0.3683496199782845 | 1 |
| 0.3686210640608035 | 1 |
| 0.36889250814332253 | 1 |
| 0.36916395222584153 | 1 |
| 0.36943539630836053 | 1 |
| 0.36970684039087953 | 1 |
| 0.36997828447339853 | 1 |
| 0.37024972855591753 | 1 |
| 0.37052117263843654 | 1 |
| 0.37079261672095554 | 1 |
| 0.37106406080347454 | 1 |
| 0.37133550488599354 | 1 |
| 0.37160694896851254 | 1 |
| 0.37187839305103154 | 1 |
| 0.37214983713355054 | 1 |
| 0.37242128121606954 | 1 |
| 0.37269272529858855 | 1 |
| 0.37296416938110755 | 1 |
| 0.37323561346362655 | 1 |
| 0.37350705754614555 | 1 |
| 0.37377850162866455 | 1 |
| 0.37404994571118355 | 1 |
| 0.37432138979370255 | 1 |
| 0.37459283387622155 | 1 |
| 0.37486427795874055 | 1 |
| 0.37513572204125945 | 1 |
| 0.37540716612377845 | 1 |
| 0.37567861020629745 | 1 |
| 0.37595005428881645 | 1 |
| 0.37622149837133545 | 1 |
| 0.37649294245385445 | 1 |
| 0.37676438653637345 | 1 |
| 0.37703583061889245 | 1 |
| 0.37730727470141145 | 1 |
| 0.37757871878393046 | 1 |
| 0.37785016286644946 | 1 |
| 0.37812160694896846 | 1 |
| 0.37839305103148746 | 1 |
| 0.37866449511400646 | 1 |
| 0.37893593919652546 | 1 |
| 0.37920738327904446 | 1 |
| 0.37947882736156346 | 1 |
| 0.37975027144408247 | 1 |
| 0.38002171552660147 | 1 |
| 0.38029315960912047 | 1 |
| 0.38056460369163947 | 1 |
| 0.38083604777415847 | 1 |
| 0.38110749185667747 | 1 |
| 0.3813789359391965 | 1 |
| 0.3816503800217155 | 1 |
| 0.3819218241042345 | 1 |
| 0.3821932681867535 | 1 |
| 0.3824647122692725 | 1 |
| 0.3827361563517915 | 1 |
| 0.3830076004343105 | 1 |
| 0.3832790445168295 | 1 |
| 0.3835504885993485 | 1 |
| 0.3838219326818675 | 1 |
| 0.3840933767643865 | 1 |
| 0.3843648208469055 | 1 |
| 0.3846362649294245 | 1 |
| 0.3849077090119435 | 1 |
| 0.3851791530944625 | 1 |
| 0.3854505971769815 | 1 |
| 0.3857220412595005 | 1 |
| 0.3859934853420195 | 1 |
| 0.3862649294245385 | 1 |
| 0.3865363735070575 | 1 |
| 0.3868078175895765 | 1 |
| 0.3870792616720955 | 1 |
| 0.3873507057546145 | 1 |
| 0.3876221498371335 | 1 |
| 0.3878935939196525 | 1 |
| 0.3881650380021715 | 1 |
| 0.3884364820846905 | 1 |
| 0.3887079261672095 | 1 |
| 0.3889793702497285 | 1 |
| 0.3892508143322475 | 1 |
| 0.3895222584147665 | 1 |
| 0.3897937024972855 | 1 |
| 0.3900651465798045 | 1 |
| 0.3903365906623235 | 1 |
| 0.3906080347448425 | 1 |
| 0.3908794788273615 | 1 |
| 0.3911509229098805 | 1 |
| 0.3914223669923995 | 1 |
| 0.3916938110749185 | 1 |
| 0.3919652551574375 | 1 |
| 0.3922366992399565 | 1 |
| 0.3925081433224755 | 1 |
| 0.3927795874049945 | 1 |
| 0.3930510314875135 | 1 |
| 0.3933224755700325 | 1 |
| 0.3935939196525515 | 1 |
| 0.39386536373507053 | 1 |
| 0.39413680781758953 | 1 |
| 0.39440825190010853 | 1 |
| 0.39467969598262753 | 1 |
| 0.39495114006514653 | 1 |
| 0.39522258414766553 | 1 |
| 0.39549402823018454 | 1 |
| 0.39576547231270354 | 1 |
| 0.39603691639522254 | 1 |
| 0.39630836047774154 | 1 |
| 0.39657980456026054 | 1 |
| 0.39685124864277954 | 1 |
| 0.39712269272529854 | 1 |
| 0.39739413680781754 | 1 |
| 0.39766558089033655 | 1 |
| 0.39793702497285555 | 1 |
| 0.39820846905537455 | 1 |
| 0.39847991313789355 | 1 |
| 0.39875135722041255 | 1 |
| 0.39902280130293155 | 1 |
| 0.39929424538545055 | 1 |
| 0.39956568946796955 | 1 |
| 0.39983713355048855 | 1 |
| 0.40010857763300756 | 1 |
| 0.40038002171552656 | 1 |
| 0.40065146579804556 | 1 |
| 0.40092290988056456 | 1 |
| 0.40119435396308356 | 1 |
| 0.40146579804560256 | 1 |
| 0.40173724212812156 | 1 |
| 0.40200868621064056 | 1 |
| 0.40228013029315957 | 1 |
| 0.40255157437567857 | 1 |
| 0.40282301845819757 | 1 |
| 0.40309446254071657 | 1 |
| 0.40336590662323557 | 1 |
| 0.40363735070575457 | 1 |
| 0.4039087947882736 | 1 |
| 0.4041802388707926 | 1 |
| 0.4044516829533116 | 1 |
| 0.4047231270358306 | 1 |
| 0.4049945711183496 | 1 |
| 0.4052660152008686 | 1 |
| 0.4055374592833876 | 1 |
| 0.4058089033659066 | 1 |
| 0.4060803474484256 | 1 |
| 0.4063517915309446 | 1 |
| 0.4066232356134636 | 1 |
| 0.4068946796959826 | 1 |
| 0.4071661237785016 | 1 |
| 0.4074375678610206 | 1 |
| 0.4077090119435396 | 1 |
| 0.4079804560260586 | 1 |
| 0.4082519001085776 | 1 |
| 0.4085233441910966 | 1 |
| 0.4087947882736156 | 1 |
| 0.4090662323561346 | 1 |
| 0.4093376764386536 | 1 |
| 0.4096091205211726 | 1 |
| 0.4098805646036916 | 1 |
| 0.4101520086862106 | 1 |
| 0.4104234527687296 | 1 |
| 0.4106948968512486 | 1 |
| 0.4109663409337676 | 1 |
| 0.4112377850162866 | 1 |
| 0.4115092290988056 | 1 |
| 0.4117806731813246 | 1 |
| 0.4120521172638436 | 1 |
| 0.4123235613463626 | 1 |
| 0.4125950054288816 | 1 |
| 0.4128664495114006 | 1 |
| 0.4131378935939196 | 1 |
| 0.4134093376764386 | 1 |
| 0.4136807817589576 | 1 |
| 0.4139522258414766 | 1 |
| 0.4142236699239956 | 1 |
| 0.4144951140065146 | 1 |
| 0.4147665580890336 | 1 |
| 0.4150380021715526 | 1 |
| 0.4153094462540716 | 1 |
| 0.4155808903365906 | 1 |
| 0.4158523344191096 | 1 |
| 0.4161237785016286 | 1 |
| 0.41639522258414763 | 1 |
| 0.41666666666666663 | 1 |
| 0.41693811074918563 | 1 |
| 0.41720955483170463 | 1 |
| 0.41748099891422363 | 1 |
| 0.41775244299674263 | 1 |
| 0.41802388707926164 | 1 |
| 0.41829533116178064 | 1 |
| 0.41856677524429964 | 1 |
| 0.41883821932681864 | 1 |
| 0.41910966340933764 | 1 |
| 0.41938110749185664 | 1 |
| 0.41965255157437564 | 1 |
| 0.41992399565689464 | 1 |
| 0.42019543973941365 | 1 |
| 0.42046688382193265 | 1 |
| 0.42073832790445165 | 1 |
| 0.42100977198697065 | 1 |
| 0.42128121606948965 | 1 |
| 0.42155266015200865 | 1 |
| 0.42182410423452765 | 1 |
| 0.42209554831704665 | 1 |
| 0.42236699239956565 | 1 |
| 0.42263843648208466 | 1 |
| 0.42290988056460366 | 1 |
| 0.42318132464712266 | 1 |
| 0.42345276872964166 | 1 |
| 0.42372421281216066 | 1 |
| 0.42399565689467966 | 1 |
| 0.42426710097719866 | 1 |
| 0.42453854505971766 | 1 |
| 0.42480998914223667 | 1 |
| 0.42508143322475567 | 1 |
| 0.42535287730727467 | 1 |
| 0.42562432138979367 | 1 |
| 0.42589576547231267 | 1 |
| 0.42616720955483167 | 1 |
| 0.4264386536373507 | 1 |
| 0.4267100977198697 | 1 |
| 0.4269815418023887 | 1 |
| 0.4272529858849077 | 1 |
| 0.4275244299674267 | 1 |
| 0.4277958740499457 | 1 |
| 0.4280673181324647 | 1 |
| 0.4283387622149837 | 1 |
| 0.4286102062975027 | 1 |
| 0.4288816503800217 | 1 |
| 0.4291530944625407 | 1 |
| 0.4294245385450597 | 1 |
| 0.4296959826275787 | 1 |
| 0.4299674267100977 | 1 |
| 0.4302388707926167 | 1 |
| 0.4305103148751357 | 1 |
| 0.4307817589576547 | 1 |
| 0.4310532030401737 | 1 |
| 0.4313246471226927 | 1 |
| 0.4315960912052117 | 1 |
| 0.4318675352877307 | 1 |
| 0.4321389793702497 | 1 |
| 0.4324104234527687 | 1 |
| 0.4326818675352877 | 1 |
| 0.4329533116178067 | 1 |
| 0.4332247557003257 | 1 |
| 0.4334961997828447 | 1 |
| 0.4337676438653637 | 1 |
| 0.4340390879478827 | 1 |
| 0.4343105320304017 | 1 |
| 0.4345819761129207 | 1 |
| 0.4348534201954397 | 1 |
| 0.4351248642779587 | 1 |
| 0.4353963083604777 | 1 |
| 0.4356677524429967 | 1 |
| 0.4359391965255157 | 1 |
| 0.4362106406080347 | 1 |
| 0.4364820846905537 | 1 |
| 0.4367535287730727 | 1 |
| 0.4370249728555917 | 1 |
| 0.4372964169381107 | 1 |
| 0.4375678610206297 | 1 |
| 0.4378393051031487 | 1 |
| 0.4381107491856677 | 1 |
| 0.4383821932681867 | 1 |
| 0.4386536373507057 | 1 |
| 0.43892508143322473 | 1 |
| 0.43919652551574373 | 1 |
| 0.43946796959826273 | 1 |
| 0.43973941368078173 | 1 |
| 0.44001085776330073 | 1 |
| 0.44028230184581973 | 1 |
| 0.44055374592833874 | 1 |
| 0.44082519001085774 | 1 |
| 0.44109663409337674 | 1 |
| 0.44136807817589574 | 1 |
| 0.44163952225841474 | 1 |
| 0.44191096634093374 | 1 |
| 0.44218241042345274 | 1 |
| 0.44245385450597174 | 1 |
| 0.44272529858849075 | 1 |
| 0.44299674267100975 | 1 |
| 0.44326818675352875 | 1 |
| 0.44353963083604775 | 1 |
| 0.44381107491856675 | 1 |
| 0.44408251900108575 | 1 |
| 0.44435396308360475 | 1 |
| 0.44462540716612375 | 1 |
| 0.44489685124864276 | 1 |
| 0.44516829533116176 | 1 |
| 0.44543973941368076 | 1 |
| 0.44571118349619976 | 1 |
| 0.44598262757871876 | 1 |
| 0.44625407166123776 | 1 |
| 0.44652551574375676 | 1 |
| 0.44679695982627576 | 1 |
| 0.44706840390879476 | 1 |
| 0.44733984799131377 | 1 |
| 0.44761129207383277 | 1 |
| 0.44788273615635177 | 1 |
| 0.44815418023887077 | 1 |
| 0.44842562432138977 | 1 |
| 0.44869706840390877 | 1 |
| 0.4489685124864278 | 1 |
| 0.4492399565689468 | 1 |
| 0.4495114006514658 | 1 |
| 0.4497828447339848 | 1 |
| 0.4500542888165038 | 1 |
| 0.4503257328990228 | 1 |
| 0.4505971769815418 | 1 |
| 0.4508686210640608 | 1 |
| 0.4511400651465798 | 1 |
| 0.4514115092290988 | 1 |
| 0.4516829533116178 | 1 |
| 0.4519543973941368 | 1 |
| 0.4522258414766558 | 1 |
| 0.4524972855591748 | 1 |
| 0.4527687296416938 | 1 |
| 0.4530401737242128 | 1 |
| 0.4533116178067318 | 1 |
| 0.4535830618892508 | 1 |
| 0.4538545059717698 | 1 |
| 0.4541259500542888 | 1 |
| 0.4543973941368078 | 1 |
| 0.4546688382193268 | 1 |
| 0.4549402823018458 | 1 |
| 0.4552117263843648 | 1 |
| 0.4554831704668838 | 1 |
| 0.4557546145494028 | 1 |
| 0.4560260586319218 | 1 |
| 0.4562975027144408 | 1 |
| 0.4565689467969598 | 1 |
| 0.4568403908794788 | 1 |
| 0.4571118349619978 | 1 |
| 0.4573832790445168 | 1 |
| 0.4576547231270358 | 1 |
| 0.4579261672095548 | 1 |
| 0.4581976112920738 | 1 |
| 0.4584690553745928 | 1 |
| 0.4587404994571118 | 1 |
| 0.4590119435396308 | 1 |
| 0.4592833876221498 | 1 |
| 0.4595548317046688 | 1 |
| 0.4598262757871878 | 1 |
| 0.4600977198697068 | 1 |
| 0.4603691639522258 | 1 |
| 0.4606406080347448 | 1 |
| 0.4609120521172638 | 1 |
| 0.4611834961997828 | 1 |
| 0.46145494028230183 | 1 |
| 0.46172638436482083 | 1 |
| 0.46199782844733983 | 1 |
| 0.46226927252985883 | 1 |
| 0.46254071661237783 | 1 |
| 0.46281216069489683 | 1 |
| 0.46308360477741584 | 1 |
| 0.46335504885993484 | 1 |
| 0.46362649294245384 | 1 |
| 0.46389793702497284 | 1 |
| 0.46416938110749184 | 1 |
| 0.46444082519001084 | 1 |
| 0.46471226927252984 | 1 |
| 0.46498371335504884 | 1 |
| 0.46525515743756785 | 1 |
| 0.46552660152008685 | 1 |
| 0.46579804560260585 | 1 |
| 0.46606948968512485 | 1 |
| 0.46634093376764385 | 1 |
| 0.46661237785016285 | 1 |
| 0.46688382193268185 | 1 |
| 0.46715526601520085 | 1 |
| 0.46742671009771986 | 1 |
| 0.46769815418023886 | 1 |
| 0.46796959826275786 | 1 |
| 0.46824104234527686 | 1 |
| 0.46851248642779586 | 1 |
| 0.46878393051031486 | 1 |
| 0.46905537459283386 | 1 |
| 0.46932681867535286 | 1 |
| 0.46959826275787186 | 1 |
| 0.46986970684039087 | 1 |
| 0.47014115092290987 | 1 |
| 0.47041259500542887 | 1 |
| 0.47068403908794787 | 1 |
| 0.47095548317046687 | 1 |
| 0.47122692725298587 | 1 |
| 0.4714983713355049 | 1 |
| 0.4717698154180239 | 1 |
| 0.4720412595005429 | 1 |
| 0.4723127035830619 | 1 |
| 0.4725841476655809 | 1 |
| 0.4728555917480999 | 1 |
| 0.4731270358306189 | 1 |
| 0.4733984799131379 | 1 |
| 0.4736699239956569 | 1 |
| 0.4739413680781759 | 1 |
| 0.4742128121606949 | 1 |
| 0.4744842562432139 | 1 |
| 0.4747557003257329 | 1 |
| 0.4750271444082519 | 1 |
| 0.4752985884907709 | 1 |
| 0.4755700325732899 | 1 |
| 0.4758414766558089 | 1 |
| 0.4761129207383279 | 1 |
| 0.4763843648208469 | 1 |
| 0.4766558089033659 | 1 |
| 0.4769272529858849 | 1 |
| 0.4771986970684039 | 1 |
| 0.4774701411509229 | 1 |
| 0.4777415852334419 | 1 |
| 0.4780130293159609 | 1 |
| 0.4782844733984799 | 1 |
| 0.4785559174809989 | 1 |
| 0.4788273615635179 | 1 |
| 0.4790988056460369 | 1 |
| 0.4793702497285559 | 1 |
| 0.4796416938110749 | 1 |
| 0.4799131378935939 | 1 |
| 0.4801845819761129 | 1 |
| 0.4804560260586319 | 1 |
| 0.4807274701411509 | 1 |
| 0.4809989142236699 | 1 |
| 0.4812703583061889 | 1 |
| 0.4815418023887079 | 1 |
| 0.4818132464712269 | 1 |
| 0.4820846905537459 | 1 |
| 0.4823561346362649 | 1 |
| 0.4826275787187839 | 1 |
| 0.4828990228013029 | 1 |
| 0.4831704668838219 | 1 |
| 0.4834419109663409 | 1 |
| 0.4837133550488599 | 1 |
| 0.48398479913137893 | 1 |
| 0.48425624321389793 | 1 |
| 0.48452768729641693 | 1 |
| 0.48479913137893593 | 1 |
| 0.48507057546145493 | 1 |
| 0.48534201954397393 | 1 |
| 0.48561346362649294 | 1 |
| 0.48588490770901194 | 1 |
| 0.48615635179153094 | 1 |
| 0.48642779587404994 | 1 |
| 0.48669923995656894 | 1 |
| 0.48697068403908794 | 1 |
| 0.48724212812160694 | 1 |
| 0.48751357220412594 | 1 |
| 0.48778501628664495 | 1 |
| 0.48805646036916395 | 1 |
| 0.48832790445168295 | 1 |
| 0.48859934853420195 | 1 |
| 0.48887079261672095 | 1 |
| 0.48914223669923995 | 1 |
| 0.48941368078175895 | 1 |
| 0.48968512486427795 | 1 |
| 0.48995656894679696 | 1 |
| 0.49022801302931596 | 1 |
| 0.49049945711183496 | 1 |
| 0.49077090119435396 | 1 |
| 0.49104234527687296 | 1 |
| 0.49131378935939196 | 1 |
| 0.49158523344191096 | 1 |
| 0.49185667752442996 | 1 |
| 0.49212812160694897 | 1 |
| 0.49239956568946797 | 1 |
| 0.49267100977198697 | 1 |
| 0.49294245385450597 | 1 |
| 0.49321389793702497 | 1 |
| 0.49348534201954397 | 1 |
| 0.493756786102063 | 1 |
| 0.494028230184582 | 1 |
| 0.494299674267101 | 1 |
| 0.49457111834962 | 1 |
| 0.494842562432139 | 1 |
| 0.495114006514658 | 1 |
| 0.495385450597177 | 1 |
| 0.495656894679696 | 1 |
| 0.495928338762215 | 1 |
| 0.496199782844734 | 1 |
| 0.496471226927253 | 1 |
| 0.496742671009772 | 1 |
| 0.497014115092291 | 1 |
| 0.49728555917481 | 1 |
| 0.497557003257329 | 1 |
| 0.497828447339848 | 1 |
| 0.498099891422367 | 1 |
| 0.498371335504886 | 1 |
| 0.498642779587405 | 1 |
| 0.498914223669924 | 1 |
| 0.499185667752443 | 1 |
| 0.499457111834962 | 1 |
| 0.499728555917481 | 1 |
| 0.5 | 1 |
| 0.500271444082519 | 1 |
| 0.500542888165038 | 1 |
| 0.500814332247557 | 1 |
| 0.501085776330076 | 1 |
| 0.501357220412595 | 1 |
| 0.501628664495114 | 1 |
| 0.501900108577633 | 1 |
| 0.502171552660152 | 1 |
| 0.502442996742671 | 1 |
| 0.50271444082519 | 1 |
| 0.502985884907709 | 1 |
| 0.503257328990228 | 1 |
| 0.503528773072747 | 1 |
| 0.503800217155266 | 1 |
| 0.504071661237785 | 1 |
| 0.504343105320304 | 1 |
| 0.504614549402823 | 1 |
| 0.504885993485342 | 1 |
| 0.505157437567861 | 1 |
| 0.50542888165038 | 1 |
| 0.505700325732899 | 1 |
| 0.505971769815418 | 1 |
| 0.506243213897937 | 1 |
| 0.506514657980456 | 1 |
| 0.506786102062975 | 1 |
| 0.507057546145494 | 1 |
| 0.507328990228013 | 1 |
| 0.507600434310532 | 1 |
| 0.507871878393051 | 1 |
| 0.50814332247557 | 1 |
| 0.508414766558089 | 1 |
| 0.508686210640608 | 1 |
| 0.508957654723127 | 1 |
| 0.509229098805646 | 1 |
| 0.509500542888165 | 1 |
| 0.509771986970684 | 1 |
| 0.510043431053203 | 1 |
| 0.510314875135722 | 1 |
| 0.510586319218241 | 1 |
| 0.51085776330076 | 1 |
| 0.511129207383279 | 1 |
| 0.511400651465798 | 1 |
| 0.511672095548317 | 1 |
| 0.511943539630836 | 1 |
| 0.512214983713355 | 1 |
| 0.512486427795874 | 1 |
| 0.5127578718783931 | 1 |
| 0.5130293159609121 | 1 |
| 0.5133007600434311 | 1 |
| 0.5135722041259501 | 1 |
| 0.5138436482084691 | 1 |
| 0.5141150922909881 | 1 |
| 0.5143865363735071 | 1 |
| 0.5146579804560261 | 1 |
| 0.5149294245385451 | 1 |
| 0.5152008686210641 | 1 |
| 0.5154723127035831 | 1 |
| 0.5157437567861021 | 1 |
| 0.5160152008686211 | 1 |
| 0.5162866449511401 | 1 |
| 0.5165580890336591 | 1 |
| 0.5168295331161781 | 1 |
| 0.5171009771986971 | 1 |
| 0.5173724212812161 | 1 |
| 0.5176438653637351 | 1 |
| 0.5179153094462541 | 1 |
| 0.5181867535287731 | 1 |
| 0.5184581976112921 | 1 |
| 0.5187296416938111 | 1 |
| 0.5190010857763301 | 1 |
| 0.5192725298588491 | 1 |
| 0.5195439739413681 | 1 |
| 0.5198154180238871 | 1 |
| 0.5200868621064061 | 1 |
| 0.5203583061889251 | 1 |
| 0.5206297502714441 | 1 |
| 0.5209011943539631 | 1 |
| 0.5211726384364821 | 1 |
| 0.5214440825190011 | 1 |
| 0.5217155266015201 | 1 |
| 0.5219869706840391 | 1 |
| 0.5222584147665581 | 1 |
| 0.5225298588490771 | 1 |
| 0.5228013029315961 | 1 |
| 0.5230727470141151 | 1 |
| 0.5233441910966341 | 1 |
| 0.5236156351791531 | 1 |
| 0.5238870792616721 | 1 |
| 0.5241585233441911 | 1 |
| 0.5244299674267101 | 1 |
| 0.5247014115092291 | 1 |
| 0.5249728555917481 | 1 |
| 0.5252442996742671 | 1 |
| 0.5255157437567861 | 1 |
| 0.5257871878393051 | 1 |
| 0.5260586319218241 | 1 |
| 0.5263300760043431 | 1 |
| 0.5266015200868621 | 1 |
| 0.5268729641693811 | 1 |
| 0.5271444082519001 | 1 |
| 0.5274158523344191 | 1 |
| 0.5276872964169381 | 1 |
| 0.5279587404994571 | 1 |
| 0.5282301845819761 | 1 |
| 0.5285016286644951 | 1 |
| 0.5287730727470141 | 1 |
| 0.5290445168295331 | 1 |
| 0.5293159609120521 | 1 |
| 0.5295874049945711 | 1 |
| 0.5298588490770901 | 1 |
| 0.5301302931596091 | 1 |
| 0.5304017372421281 | 1 |
| 0.5306731813246471 | 1 |
| 0.5309446254071661 | 1 |
| 0.5312160694896851 | 1 |
| 0.5314875135722041 | 1 |
| 0.5317589576547231 | 1 |
| 0.5320304017372421 | 1 |
| 0.5323018458197611 | 1 |
| 0.5325732899022801 | 1 |
| 0.5328447339847991 | 1 |
| 0.5331161780673181 | 1 |
| 0.5333876221498371 | 1 |
| 0.5336590662323561 | 1 |
| 0.5339305103148752 | 1 |
| 0.5342019543973942 | 1 |
| 0.5344733984799132 | 1 |
| 0.5347448425624322 | 1 |
| 0.5350162866449512 | 1 |
| 0.5352877307274702 | 1 |
| 0.5355591748099892 | 1 |
| 0.5358306188925082 | 1 |
| 0.5361020629750272 | 1 |
| 0.5363735070575462 | 1 |
| 0.5366449511400652 | 1 |
| 0.5369163952225842 | 1 |
| 0.5371878393051032 | 1 |
| 0.5374592833876222 | 1 |
| 0.5377307274701412 | 1 |
| 0.5380021715526602 | 1 |
| 0.5382736156351792 | 1 |
| 0.5385450597176982 | 1 |
| 0.5388165038002172 | 1 |
| 0.5390879478827362 | 1 |
| 0.5393593919652552 | 1 |
| 0.5396308360477742 | 1 |
| 0.5399022801302932 | 1 |
| 0.5401737242128122 | 1 |
| 0.5404451682953312 | 1 |
| 0.5407166123778502 | 1 |
| 0.5409880564603692 | 1 |
| 0.5412595005428882 | 1 |
| 0.5415309446254072 | 1 |
| 0.5418023887079262 | 1 |
| 0.5420738327904452 | 1 |
| 0.5423452768729642 | 1 |
| 0.5426167209554832 | 1 |
| 0.5428881650380022 | 1 |
| 0.5431596091205212 | 1 |
| 0.5434310532030402 | 1 |
| 0.5437024972855592 | 1 |
| 0.5439739413680782 | 1 |
| 0.5442453854505972 | 1 |
| 0.5445168295331162 | 1 |
| 0.5447882736156352 | 1 |
| 0.5450597176981542 | 1 |
| 0.5453311617806732 | 1 |
| 0.5456026058631922 | 1 |
| 0.5458740499457112 | 1 |
| 0.5461454940282302 | 1 |
| 0.5464169381107492 | 1 |
| 0.5466883821932682 | 1 |
| 0.5469598262757872 | 1 |
| 0.5472312703583062 | 1 |
| 0.5475027144408252 | 1 |
| 0.5477741585233442 | 1 |
| 0.5480456026058632 | 1 |
| 0.5483170466883822 | 1 |
| 0.5485884907709012 | 1 |
| 0.5488599348534202 | 1 |
| 0.5491313789359392 | 1 |
| 0.5494028230184582 | 1 |
| 0.5496742671009772 | 1 |
| 0.5499457111834962 | 1 |
| 0.5502171552660152 | 1 |
| 0.5504885993485342 | 1 |
| 0.5507600434310532 | 1 |
| 0.5510314875135722 | 1 |
| 0.5513029315960912 | 1 |
| 0.5515743756786102 | 1 |
| 0.5518458197611292 | 1 |
| 0.5521172638436482 | 1 |
| 0.5523887079261672 | 1 |
| 0.5526601520086862 | 1 |
| 0.5529315960912052 | 1 |
| 0.5532030401737242 | 1 |
| 0.5534744842562432 | 1 |
| 0.5537459283387622 | 1 |
| 0.5540173724212812 | 1 |
| 0.5542888165038002 | 1 |
| 0.5545602605863192 | 1 |
| 0.5548317046688382 | 1 |
| 0.5551031487513572 | 1 |
| 0.5553745928338762 | 1 |
| 0.5556460369163952 | 1 |
| 0.5559174809989142 | 1 |
| 0.5561889250814332 | 1 |
| 0.5564603691639523 | 1 |
| 0.5567318132464713 | 1 |
| 0.5570032573289903 | 1 |
| 0.5572747014115093 | 1 |
| 0.5575461454940283 | 1 |
| 0.5578175895765473 | 1 |
| 0.5580890336590663 | 1 |
| 0.5583604777415853 | 1 |
| 0.5586319218241043 | 1 |
| 0.5589033659066233 | 1 |
| 0.5591748099891423 | 1 |
| 0.5594462540716613 | 1 |
| 0.5597176981541803 | 1 |
| 0.5599891422366993 | 1 |
| 0.5602605863192183 | 1 |
| 0.5605320304017373 | 1 |
| 0.5608034744842563 | 1 |
| 0.5610749185667753 | 1 |
| 0.5613463626492943 | 1 |
| 0.5616178067318133 | 1 |
| 0.5618892508143323 | 1 |
| 0.5621606948968513 | 1 |
| 0.5624321389793703 | 1 |
| 0.5627035830618892 | 1 |
| 0.5629750271444083 | 1 |
| 0.5632464712269272 | 1 |
| 0.5635179153094463 | 1 |
| 0.5637893593919652 | 1 |
| 0.5640608034744843 | 1 |
| 0.5643322475570032 | 1 |
| 0.5646036916395223 | 1 |
| 0.5648751357220412 | 1 |
| 0.5651465798045603 | 1 |
| 0.5654180238870792 | 1 |
| 0.5656894679695983 | 1 |
| 0.5659609120521172 | 1 |
| 0.5662323561346363 | 1 |
| 0.5665038002171552 | 1 |
| 0.5667752442996743 | 1 |
| 0.5670466883821932 | 1 |
| 0.5673181324647123 | 1 |
| 0.5675895765472312 | 1 |
| 0.5678610206297503 | 1 |
| 0.5681324647122692 | 1 |
| 0.5684039087947883 | 1 |
| 0.5686753528773072 | 1 |
| 0.5689467969598263 | 1 |
| 0.5692182410423452 | 1 |
| 0.5694896851248643 | 1 |
| 0.5697611292073832 | 1 |
| 0.5700325732899023 | 1 |
| 0.5703040173724212 | 1 |
| 0.5705754614549403 | 1 |
| 0.5708469055374592 | 1 |
| 0.5711183496199783 | 1 |
| 0.5713897937024972 | 1 |
| 0.5716612377850163 | 1 |
| 0.5719326818675352 | 1 |
| 0.5722041259500543 | 1 |
| 0.5724755700325732 | 1 |
| 0.5727470141150923 | 1 |
| 0.5730184581976112 | 1 |
| 0.5732899022801303 | 1 |
| 0.5735613463626492 | 1 |
| 0.5738327904451683 | 1 |
| 0.5741042345276872 | 1 |
| 0.5743756786102063 | 1 |
| 0.5746471226927252 | 1 |
| 0.5749185667752443 | 1 |
| 0.5751900108577632 | 1 |
| 0.5754614549402823 | 1 |
| 0.5757328990228012 | 1 |
| 0.5760043431053203 | 1 |
| 0.5762757871878392 | 1 |
| 0.5765472312703583 | 1 |
| 0.5768186753528772 | 1 |
| 0.5770901194353963 | 1 |
| 0.5773615635179152 | 1 |
| 0.5776330076004343 | 1 |
| 0.5779044516829532 | 1 |
| 0.5781758957654723 | 1 |
| 0.5784473398479912 | 1 |
| 0.5787187839305103 | 1 |
| 0.5789902280130292 | 1 |
| 0.5792616720955484 | 1 |
| 0.5795331161780672 | 1 |
| 0.5798045602605864 | 1 |
| 0.5800760043431052 | 1 |
| 0.5803474484256244 | 1 |
| 0.5806188925081432 | 1 |
| 0.5808903365906624 | 1 |
| 0.5811617806731812 | 1 |
| 0.5814332247557004 | 1 |
| 0.5817046688382193 | 1 |
| 0.5819761129207384 | 1 |
| 0.5822475570032573 | 1 |
| 0.5825190010857764 | 1 |
| 0.5827904451682953 | 1 |
| 0.5830618892508144 | 1 |
| 0.5833333333333333 | 1 |
| 0.5836047774158524 | 1 |
| 0.5838762214983713 | 1 |
| 0.5841476655808904 | 1 |
| 0.5844191096634093 | 1 |
| 0.5846905537459284 | 1 |
| 0.5849619978284473 | 1 |
| 0.5852334419109664 | 1 |
| 0.5855048859934853 | 1 |
| 0.5857763300760044 | 1 |
| 0.5860477741585233 | 1 |
| 0.5863192182410424 | 1 |
| 0.5865906623235613 | 1 |
| 0.5868621064060804 | 1 |
| 0.5871335504885993 | 1 |
| 0.5874049945711184 | 1 |
| 0.5876764386536373 | 1 |
| 0.5879478827361564 | 1 |
| 0.5882193268186753 | 1 |
| 0.5884907709011944 | 1 |
| 0.5887622149837133 | 1 |
| 0.5890336590662324 | 1 |
| 0.5893051031487513 | 1 |
| 0.5895765472312704 | 1 |
| 0.5898479913137893 | 1 |
| 0.5901194353963084 | 1 |
| 0.5903908794788273 | 1 |
| 0.5906623235613464 | 1 |
| 0.5909337676438653 | 1 |
| 0.5912052117263844 | 1 |
| 0.5914766558089033 | 1 |
| 0.5917480998914224 | 1 |
| 0.5920195439739413 | 1 |
| 0.5922909880564604 | 1 |
| 0.5925624321389793 | 1 |
| 0.5928338762214984 | 1 |
| 0.5931053203040173 | 1 |
| 0.5933767643865364 | 1 |
| 0.5936482084690553 | 1 |
| 0.5939196525515744 | 1 |
| 0.5941910966340933 | 1 |
| 0.5944625407166124 | 1 |
| 0.5947339847991313 | 1 |
| 0.5950054288816504 | 1 |
| 0.5952768729641693 | 1 |
| 0.5955483170466884 | 1 |
| 0.5958197611292073 | 1 |
| 0.5960912052117264 | 1 |
| 0.5963626492942453 | 1 |
| 0.5966340933767644 | 1 |
| 0.5969055374592833 | 1 |
| 0.5971769815418024 | 1 |
| 0.5974484256243213 | 1 |
| 0.5977198697068404 | 1 |
| 0.5979913137893593 | 1 |
| 0.5982627578718784 | 1 |
| 0.5985342019543973 | 1 |
| 0.5988056460369164 | 1 |
| 0.5990770901194353 | 1 |
| 0.5993485342019544 | 1 |
| 0.5996199782844733 | 1 |
| 0.5998914223669924 | 1 |
| 0.6001628664495113 | 1 |
| 0.6004343105320304 | 1 |
| 0.6007057546145493 | 1 |
| 0.6009771986970684 | 1 |
| 0.6012486427795873 | 1 |
| 0.6015200868621065 | 1 |
| 0.6017915309446253 | 1 |
| 0.6020629750271445 | 1 |
| 0.6023344191096633 | 1 |
| 0.6026058631921825 | 1 |
| 0.6028773072747013 | 1 |
| 0.6031487513572205 | 1 |
| 0.6034201954397393 | 1 |
| 0.6036916395222585 | 1 |
| 0.6039630836047774 | 1 |
| 0.6042345276872965 | 1 |
| 0.6045059717698154 | 1 |
| 0.6047774158523345 | 1 |
| 0.6050488599348534 | 1 |
| 0.6053203040173725 | 1 |
| 0.6055917480998914 | 1 |
| 0.6058631921824105 | 1 |
| 0.6061346362649294 | 1 |
| 0.6064060803474485 | 1 |
| 0.6066775244299674 | 1 |
| 0.6069489685124865 | 1 |
| 0.6072204125950054 | 1 |
| 0.6074918566775245 | 1 |
| 0.6077633007600434 | 1 |
| 0.6080347448425625 | 1 |
| 0.6083061889250814 | 1 |
| 0.6085776330076005 | 1 |
| 0.6088490770901194 | 1 |
| 0.6091205211726385 | 1 |
| 0.6093919652551574 | 1 |
| 0.6096634093376765 | 1 |
| 0.6099348534201954 | 1 |
| 0.6102062975027145 | 1 |
| 0.6104777415852334 | 1 |
| 0.6107491856677525 | 1 |
| 0.6110206297502714 | 1 |
| 0.6112920738327905 | 1 |
| 0.6115635179153094 | 1 |
| 0.6118349619978285 | 1 |
| 0.6121064060803474 | 1 |
| 0.6123778501628665 | 1 |
| 0.6126492942453854 | 1 |
| 0.6129207383279045 | 1 |
| 0.6131921824104234 | 1 |
| 0.6134636264929425 | 1 |
| 0.6137350705754614 | 1 |
| 0.6140065146579805 | 1 |
| 0.6142779587404994 | 1 |
| 0.6145494028230185 | 1 |
| 0.6148208469055374 | 1 |
| 0.6150922909880565 | 1 |
| 0.6153637350705754 | 1 |
| 0.6156351791530945 | 1 |
| 0.6159066232356134 | 1 |
| 0.6161780673181325 | 1 |
| 0.6164495114006514 | 1 |
| 0.6167209554831705 | 1 |
| 0.6169923995656894 | 1 |
| 0.6172638436482085 | 1 |
| 0.6175352877307274 | 1 |
| 0.6178067318132465 | 1 |
| 0.6180781758957654 | 1 |
| 0.6183496199782845 | 1 |
| 0.6186210640608034 | 1 |
| 0.6188925081433225 | 1 |
| 0.6191639522258414 | 1 |
| 0.6194353963083605 | 1 |
| 0.6197068403908794 | 1 |
| 0.6199782844733985 | 1 |
| 0.6202497285559174 | 1 |
| 0.6205211726384365 | 1 |
| 0.6207926167209554 | 1 |
| 0.6210640608034745 | 1 |
| 0.6213355048859934 | 1 |
| 0.6216069489685125 | 1 |
| 0.6218783930510314 | 1 |
| 0.6221498371335505 | 1 |
| 0.6224212812160694 | 1 |
| 0.6226927252985885 | 1 |
| 0.6229641693811074 | 1 |
| 0.6232356134636265 | 1 |
| 0.6235070575461454 | 1 |
| 0.6237785016286646 | 1 |
| 0.6240499457111834 | 1 |
| 0.6243213897937026 | 1 |
| 0.6245928338762214 | 1 |
| 0.6248642779587406 | 1 |
| 0.6251357220412594 | 1 |
| 0.6254071661237786 | 1 |
| 0.6256786102062974 | 1 |
| 0.6259500542888166 | 1 |
| 0.6262214983713354 | 1 |
| 0.6264929424538546 | 1 |
| 0.6267643865363735 | 1 |
| 0.6270358306188926 | 1 |
| 0.6273072747014115 | 1 |
| 0.6275787187839306 | 1 |
| 0.6278501628664495 | 1 |
| 0.6281216069489686 | 1 |
| 0.6283930510314875 | 1 |
| 0.6286644951140066 | 1 |
| 0.6289359391965255 | 1 |
| 0.6292073832790446 | 1 |
| 0.6294788273615635 | 1 |
| 0.6297502714440826 | 1 |
| 0.6300217155266015 | 1 |
| 0.6302931596091206 | 1 |
| 0.6305646036916395 | 1 |
| 0.6308360477741586 | 1 |
| 0.6311074918566775 | 1 |
| 0.6313789359391966 | 1 |
| 0.6316503800217155 | 1 |
| 0.6319218241042346 | 1 |
| 0.6321932681867535 | 1 |
| 0.6324647122692726 | 1 |
| 0.6327361563517915 | 1 |
| 0.6330076004343106 | 1 |
| 0.6332790445168295 | 1 |
| 0.6335504885993486 | 1 |
| 0.6338219326818675 | 1 |
| 0.6340933767643866 | 1 |
| 0.6343648208469055 | 1 |
| 0.6346362649294246 | 1 |
| 0.6349077090119435 | 1 |
| 0.6351791530944626 | 1 |
| 0.6354505971769815 | 1 |
| 0.6357220412595006 | 1 |
| 0.6359934853420195 | 1 |
| 0.6362649294245386 | 1 |
| 0.6365363735070575 | 1 |
| 0.6368078175895766 | 1 |
| 0.6370792616720955 | 1 |
| 0.6373507057546146 | 1 |
| 0.6376221498371335 | 1 |
| 0.6378935939196526 | 1 |
| 0.6381650380021715 | 1 |
| 0.6384364820846906 | 1 |
| 0.6387079261672095 | 1 |
| 0.6389793702497286 | 1 |
| 0.6392508143322475 | 1 |
| 0.6395222584147666 | 1 |
| 0.6397937024972855 | 1 |
| 0.6400651465798046 | 1 |
| 0.6403365906623235 | 1 |
| 0.6406080347448426 | 1 |
| 0.6408794788273615 | 1 |
| 0.6411509229098806 | 1 |
| 0.6414223669923995 | 1 |
| 0.6416938110749186 | 1 |
| 0.6419652551574375 | 1 |
| 0.6422366992399566 | 1 |
| 0.6425081433224755 | 1 |
| 0.6427795874049946 | 1 |
| 0.6430510314875135 | 1 |
| 0.6433224755700326 | 1 |
| 0.6435939196525515 | 1 |
| 0.6438653637350706 | 1 |
| 0.6441368078175895 | 1 |
| 0.6444082519001086 | 1 |
| 0.6446796959826275 | 1 |
| 0.6449511400651466 | 1 |
| 0.6452225841476655 | 1 |
| 0.6454940282301846 | 1 |
| 0.6457654723127035 | 1 |
| 0.6460369163952226 | 1 |
| 0.6463083604777415 | 1 |
| 0.6465798045602607 | 1 |
| 0.6468512486427795 | 1 |
| 0.6471226927252987 | 1 |
| 0.6473941368078175 | 1 |
| 0.6476655808903367 | 1 |
| 0.6479370249728555 | 1 |
| 0.6482084690553747 | 1 |
| 0.6484799131378935 | 1 |
| 0.6487513572204127 | 1 |
| 0.6490228013029316 | 1 |
| 0.6492942453854507 | 1 |
| 0.6495656894679696 | 1 |
| 0.6498371335504887 | 1 |
| 0.6501085776330076 | 1 |
| 0.6503800217155267 | 1 |
| 0.6506514657980456 | 1 |
| 0.6509229098805647 | 1 |
| 0.6511943539630836 | 1 |
| 0.6514657980456027 | 1 |
| 0.6517372421281216 | 1 |
| 0.6520086862106407 | 1 |
| 0.6522801302931596 | 1 |
| 0.6525515743756787 | 1 |
| 0.6528230184581976 | 1 |
| 0.6530944625407167 | 1 |
| 0.6533659066232356 | 1 |
| 0.6536373507057547 | 1 |
| 0.6539087947882736 | 1 |
| 0.6541802388707927 | 1 |
| 0.6544516829533116 | 1 |
| 0.6547231270358307 | 1 |
| 0.6549945711183496 | 1 |
| 0.6552660152008687 | 1 |
| 0.6555374592833876 | 1 |
| 0.6558089033659067 | 1 |
| 0.6560803474484256 | 1 |
| 0.6563517915309447 | 1 |
| 0.6566232356134636 | 1 |
| 0.6568946796959827 | 1 |
| 0.6571661237785016 | 1 |
| 0.6574375678610207 | 1 |
| 0.6577090119435396 | 1 |
| 0.6579804560260587 | 1 |
| 0.6582519001085776 | 1 |
| 0.6585233441910967 | 1 |
| 0.6587947882736156 | 1 |
| 0.6590662323561347 | 1 |
| 0.6593376764386536 | 1 |
| 0.6596091205211727 | 1 |
| 0.6598805646036916 | 1 |
| 0.6601520086862107 | 1 |
| 0.6604234527687296 | 1 |
| 0.6606948968512487 | 1 |
| 0.6609663409337676 | 1 |
| 0.6612377850162867 | 1 |
| 0.6615092290988056 | 1 |
| 0.6617806731813247 | 1 |
| 0.6620521172638436 | 1 |
| 0.6623235613463627 | 1 |
| 0.6625950054288816 | 1 |
| 0.6628664495114007 | 1 |
| 0.6631378935939196 | 1 |
| 0.6634093376764387 | 1 |
| 0.6636807817589576 | 1 |
| 0.6639522258414767 | 1 |
| 0.6642236699239956 | 1 |
| 0.6644951140065147 | 1 |
| 0.6647665580890336 | 1 |
| 0.6650380021715527 | 1 |
| 0.6653094462540716 | 1 |
| 0.6655808903365907 | 1 |
| 0.6658523344191096 | 1 |
| 0.6661237785016287 | 1 |
| 0.6663952225841476 | 1 |
| 0.6666666666666667 | 1 |
| 0.6669381107491856 | 1 |
| 0.6672095548317047 | 1 |
| 0.6674809989142236 | 1 |
| 0.6677524429967427 | 1 |
| 0.6680238870792616 | 1 |
| 0.6682953311617807 | 1 |
| 0.6685667752442996 | 1 |
| 0.6688382193268188 | 1 |
| 0.6691096634093376 | 1 |
| 0.6693811074918568 | 1 |
| 0.6696525515743756 | 1 |
| 0.6699239956568948 | 1 |
| 0.6701954397394136 | 1 |
| 0.6704668838219328 | 1 |
| 0.6707383279044516 | 1 |
| 0.6710097719869708 | 1 |
| 0.6712812160694897 | 1 |
| 0.6715526601520088 | 1 |
| 0.6718241042345277 | 1 |
| 0.6720955483170468 | 1 |
| 0.6723669923995657 | 1 |
| 0.6726384364820848 | 1 |
| 0.6729098805646037 | 1 |
| 0.6731813246471228 | 1 |
| 0.6734527687296417 | 1 |
| 0.6737242128121608 | 1 |
| 0.6739956568946797 | 1 |
| 0.6742671009771988 | 1 |
| 0.6745385450597177 | 1 |
| 0.6748099891422368 | 1 |
| 0.6750814332247557 | 1 |
| 0.6753528773072748 | 1 |
| 0.6756243213897937 | 1 |
| 0.6758957654723128 | 1 |
| 0.6761672095548317 | 1 |
| 0.6764386536373508 | 1 |
| 0.6767100977198697 | 1 |
| 0.6769815418023888 | 1 |
| 0.6772529858849077 | 1 |
| 0.6775244299674268 | 1 |
| 0.6777958740499457 | 1 |
| 0.6780673181324648 | 1 |
| 0.6783387622149837 | 1 |
| 0.6786102062975028 | 1 |
| 0.6788816503800217 | 1 |
| 0.6791530944625408 | 1 |
| 0.6794245385450597 | 1 |
| 0.6796959826275788 | 1 |
| 0.6799674267100977 | 1 |
| 0.6802388707926168 | 1 |
| 0.6805103148751357 | 1 |
| 0.6807817589576548 | 1 |
| 0.6810532030401737 | 1 |
| 0.6813246471226928 | 1 |
| 0.6815960912052117 | 1 |
| 0.6818675352877308 | 1 |
| 0.6821389793702497 | 1 |
| 0.6824104234527688 | 1 |
| 0.6826818675352877 | 1 |
| 0.6829533116178068 | 1 |
| 0.6832247557003257 | 1 |
| 0.6834961997828448 | 1 |
| 0.6837676438653637 | 1 |
| 0.6840390879478828 | 1 |
| 0.6843105320304017 | 1 |
| 0.6845819761129208 | 1 |
| 0.6848534201954397 | 1 |
| 0.6851248642779588 | 1 |
| 0.6853963083604777 | 1 |
| 0.6856677524429968 | 1 |
| 0.6859391965255157 | 1 |
| 0.6862106406080348 | 1 |
| 0.6864820846905537 | 1 |
| 0.6867535287730728 | 1 |
| 0.6870249728555917 | 1 |
| 0.6872964169381108 | 1 |
| 0.6875678610206297 | 1 |
| 0.6878393051031487 | 1 |
| 0.6881107491856677 | 1 |
| 0.6883821932681867 | 1 |
| 0.6886536373507057 | 1 |
| 0.6889250814332247 | 1 |
| 0.6891965255157437 | 1 |
| 0.6894679695982627 | 1 |
| 0.6897394136807817 | 1 |
| 0.6900108577633007 | 1 |
| 0.6902823018458197 | 1 |
| 0.6905537459283387 | 1 |
| 0.6908251900108577 | 1 |
| 0.6910966340933767 | 1 |
| 0.6913680781758957 | 1 |
| 0.6916395222584147 | 1 |
| 0.6919109663409337 | 1 |
| 0.6921824104234527 | 1 |
| 0.6924538545059717 | 1 |
| 0.6927252985884907 | 1 |
| 0.6929967426710097 | 1 |
| 0.6932681867535287 | 1 |
| 0.6935396308360477 | 1 |
| 0.6938110749185668 | 1 |
| 0.6940825190010858 | 1 |
| 0.6943539630836048 | 1 |
| 0.6946254071661238 | 1 |
| 0.6948968512486428 | 1 |
| 0.6951682953311618 | 1 |
| 0.6954397394136808 | 1 |
| 0.6957111834961998 | 1 |
| 0.6959826275787188 | 1 |
| 0.6962540716612378 | 1 |
| 0.6965255157437568 | 1 |
| 0.6967969598262758 | 1 |
| 0.6970684039087948 | 1 |
| 0.6973398479913138 | 1 |
| 0.6976112920738328 | 1 |
| 0.6978827361563518 | 1 |
| 0.6981541802388708 | 1 |
| 0.6984256243213898 | 1 |
| 0.6986970684039088 | 1 |
| 0.6989685124864278 | 1 |
| 0.6992399565689468 | 1 |
| 0.6995114006514658 | 1 |
| 0.6997828447339848 | 1 |
| 0.7000542888165038 | 1 |
| 0.7003257328990228 | 1 |
| 0.7005971769815418 | 1 |
| 0.7008686210640608 | 1 |
| 0.7011400651465798 | 1 |
| 0.7014115092290988 | 1 |
| 0.7016829533116178 | 1 |
| 0.7019543973941368 | 1 |
| 0.7022258414766558 | 1 |
| 0.7024972855591748 | 1 |
| 0.7027687296416938 | 1 |
| 0.7030401737242128 | 1 |
| 0.7033116178067318 | 1 |
| 0.7035830618892508 | 1 |
| 0.7038545059717698 | 1 |
| 0.7041259500542888 | 1 |
| 0.7043973941368078 | 1 |
| 0.7046688382193268 | 1 |
| 0.7049402823018458 | 1 |
| 0.7052117263843648 | 1 |
| 0.7054831704668838 | 1 |
| 0.7057546145494028 | 1 |
| 0.7060260586319218 | 1 |
| 0.7062975027144408 | 1 |
| 0.7065689467969598 | 1 |
| 0.7068403908794788 | 1 |
| 0.7071118349619978 | 1 |
| 0.7073832790445168 | 1 |
| 0.7076547231270358 | 1 |
| 0.7079261672095548 | 1 |
| 0.7081976112920738 | 1 |
| 0.7084690553745928 | 1 |
| 0.7087404994571118 | 1 |
| 0.7090119435396308 | 1 |
| 0.7092833876221498 | 1 |
| 0.7095548317046688 | 1 |
| 0.7098262757871878 | 1 |
| 0.7100977198697068 | 1 |
| 0.7103691639522258 | 1 |
| 0.7106406080347448 | 1 |
| 0.7109120521172638 | 1 |
| 0.7111834961997828 | 1 |
| 0.7114549402823018 | 1 |
| 0.7117263843648208 | 1 |
| 0.7119978284473398 | 1 |
| 0.7122692725298588 | 1 |
| 0.7125407166123778 | 1 |
| 0.7128121606948968 | 1 |
| 0.7130836047774158 | 1 |
| 0.7133550488599348 | 1 |
| 0.7136264929424538 | 1 |
| 0.7138979370249728 | 1 |
| 0.7141693811074918 | 1 |
| 0.7144408251900108 | 1 |
| 0.7147122692725298 | 1 |
| 0.7149837133550488 | 1 |
| 0.7152551574375678 | 1 |
| 0.7155266015200868 | 1 |
| 0.7157980456026058 | 1 |
| 0.7160694896851248 | 1 |
| 0.7163409337676439 | 1 |
| 0.7166123778501629 | 1 |
| 0.7168838219326819 | 1 |
| 0.7171552660152009 | 1 |
| 0.7174267100977199 | 1 |
| 0.7176981541802389 | 1 |
| 0.7179695982627579 | 1 |
| 0.7182410423452769 | 1 |
| 0.7185124864277959 | 1 |
| 0.7187839305103149 | 1 |
| 0.7190553745928339 | 1 |
| 0.7193268186753529 | 1 |
| 0.7195982627578719 | 1 |
| 0.7198697068403909 | 1 |
| 0.7201411509229099 | 1 |
| 0.7204125950054289 | 1 |
| 0.7206840390879479 | 1 |
| 0.7209554831704669 | 1 |
| 0.7212269272529859 | 1 |
| 0.7214983713355049 | 1 |
| 0.7217698154180239 | 1 |
| 0.7220412595005429 | 1 |
| 0.7223127035830619 | 1 |
| 0.7225841476655809 | 1 |
| 0.7228555917480999 | 1 |
| 0.7231270358306189 | 1 |
| 0.7233984799131379 | 1 |
| 0.7236699239956569 | 1 |
| 0.7239413680781759 | 1 |
| 0.7242128121606949 | 1 |
| 0.7244842562432139 | 1 |
| 0.7247557003257329 | 1 |
| 0.7250271444082519 | 1 |
| 0.7252985884907709 | 1 |
| 0.7255700325732899 | 1 |
| 0.7258414766558089 | 1 |
| 0.7261129207383279 | 1 |
| 0.7263843648208469 | 1 |
| 0.7266558089033659 | 1 |
| 0.7269272529858849 | 1 |
| 0.7271986970684039 | 1 |
| 0.7274701411509229 | 1 |
| 0.7277415852334419 | 1 |
| 0.7280130293159609 | 1 |
| 0.7282844733984799 | 1 |
| 0.7285559174809989 | 1 |
| 0.7288273615635179 | 1 |
| 0.7290988056460369 | 1 |
| 0.7293702497285559 | 1 |
| 0.7296416938110749 | 1 |
| 0.7299131378935939 | 1 |
| 0.7301845819761129 | 1 |
| 0.7304560260586319 | 1 |
| 0.7307274701411509 | 1 |
| 0.7309989142236699 | 1 |
| 0.7312703583061889 | 1 |
| 0.7315418023887079 | 1 |
| 0.7318132464712269 | 1 |
| 0.7320846905537459 | 1 |
| 0.7323561346362649 | 1 |
| 0.7326275787187839 | 1 |
| 0.7328990228013029 | 1 |
| 0.7331704668838219 | 1 |
| 0.7334419109663409 | 1 |
| 0.7337133550488599 | 1 |
| 0.7339847991313789 | 1 |
| 0.7342562432138979 | 1 |
| 0.7345276872964169 | 1 |
| 0.7347991313789359 | 1 |
| 0.7350705754614549 | 1 |
| 0.7353420195439739 | 1 |
| 0.7356134636264929 | 1 |
| 0.7358849077090119 | 1 |
| 0.7361563517915309 | 1 |
| 0.7364277958740499 | 1 |
| 0.7366992399565689 | 1 |
| 0.7369706840390879 | 1 |
| 0.7372421281216069 | 1 |
| 0.737513572204126 | 1 |
| 0.737785016286645 | 1 |
| 0.738056460369164 | 1 |
| 0.738327904451683 | 1 |
| 0.738599348534202 | 1 |
| 0.738870792616721 | 1 |
| 0.73914223669924 | 1 |
| 0.739413680781759 | 1 |
| 0.739685124864278 | 1 |
| 0.739956568946797 | 1 |
| 0.740228013029316 | 1 |
| 0.740499457111835 | 1 |
| 0.740770901194354 | 1 |
| 0.741042345276873 | 1 |
| 0.741313789359392 | 1 |
| 0.741585233441911 | 1 |
| 0.74185667752443 | 1 |
| 0.742128121606949 | 1 |
| 0.742399565689468 | 1 |
| 0.742671009771987 | 1 |
| 0.742942453854506 | 1 |
| 0.743213897937025 | 1 |
| 0.743485342019544 | 1 |
| 0.743756786102063 | 1 |
| 0.744028230184582 | 1 |
| 0.744299674267101 | 1 |
| 0.74457111834962 | 1 |
| 0.744842562432139 | 1 |
| 0.745114006514658 | 1 |
| 0.745385450597177 | 1 |
| 0.745656894679696 | 1 |
| 0.745928338762215 | 1 |
| 0.746199782844734 | 1 |
| 0.746471226927253 | 1 |
| 0.746742671009772 | 1 |
| 0.747014115092291 | 1 |
| 0.74728555917481 | 1 |
| 0.747557003257329 | 1 |
| 0.747828447339848 | 1 |
| 0.748099891422367 | 1 |
| 0.748371335504886 | 1 |
| 0.748642779587405 | 1 |
| 0.748914223669924 | 1 |
| 0.749185667752443 | 1 |
| 0.749457111834962 | 1 |
| 0.749728555917481 | 1 |
| 0.75 | 1 |
| 0.750271444082519 | 1 |
| 0.750542888165038 | 1 |
| 0.750814332247557 | 1 |
| 0.751085776330076 | 1 |
| 0.751357220412595 | 1 |
| 0.751628664495114 | 1 |
| 0.751900108577633 | 1 |
| 0.752171552660152 | 1 |
| 0.752442996742671 | 1 |
| 0.75271444082519 | 1 |
| 0.752985884907709 | 1 |
| 0.753257328990228 | 1 |
| 0.753528773072747 | 1 |
| 0.753800217155266 | 1 |
| 0.754071661237785 | 1 |
| 0.754343105320304 | 1 |
| 0.754614549402823 | 1 |
| 0.754885993485342 | 1 |
| 0.755157437567861 | 1 |
| 0.75542888165038 | 1 |
| 0.755700325732899 | 1 |
| 0.755971769815418 | 1 |
| 0.756243213897937 | 1 |
| 0.756514657980456 | 1 |
| 0.756786102062975 | 1 |
| 0.757057546145494 | 1 |
| 0.757328990228013 | 1 |
| 0.757600434310532 | 1 |
| 0.757871878393051 | 1 |
| 0.75814332247557 | 1 |
| 0.758414766558089 | 1 |
| 0.758686210640608 | 1 |
| 0.758957654723127 | 1 |
| 0.759229098805646 | 1 |
| 0.759500542888165 | 1 |
| 0.759771986970684 | 1 |
| 0.760043431053203 | 1 |
| 0.760314875135722 | 1 |
| 0.760586319218241 | 1 |
| 0.76085776330076 | 1 |
| 0.761129207383279 | 1 |
| 0.761400651465798 | 1 |
| 0.761672095548317 | 1 |
| 0.761943539630836 | 1 |
| 0.762214983713355 | 1 |
| 0.762486427795874 | 1 |
| 0.7627578718783931 | 1 |
| 0.7630293159609121 | 1 |
| 0.7633007600434311 | 1 |
| 0.7635722041259501 | 1 |
| 0.7638436482084691 | 1 |
| 0.7641150922909881 | 1 |
| 0.7643865363735071 | 1 |
| 0.7646579804560261 | 1 |
| 0.7649294245385451 | 1 |
| 0.7652008686210641 | 1 |
| 0.7654723127035831 | 1 |
| 0.7657437567861021 | 1 |
| 0.7660152008686211 | 1 |
| 0.7662866449511401 | 1 |
| 0.7665580890336591 | 1 |
| 0.7668295331161781 | 1 |
| 0.7671009771986971 | 1 |
| 0.7673724212812161 | 1 |
| 0.7676438653637351 | 1 |
| 0.7679153094462541 | 1 |
| 0.7681867535287731 | 1 |
| 0.7684581976112921 | 1 |
| 0.7687296416938111 | 1 |
| 0.7690010857763301 | 1 |
| 0.7692725298588491 | 1 |
| 0.7695439739413681 | 1 |
| 0.7698154180238871 | 1 |
| 0.7700868621064061 | 1 |
| 0.7703583061889251 | 1 |
| 0.7706297502714441 | 1 |
| 0.7709011943539631 | 1 |
| 0.7711726384364821 | 1 |
| 0.7714440825190011 | 1 |
| 0.7717155266015201 | 1 |
| 0.7719869706840391 | 1 |
| 0.7722584147665581 | 1 |
| 0.7725298588490771 | 1 |
| 0.7728013029315961 | 1 |
| 0.7730727470141151 | 1 |
| 0.7733441910966341 | 1 |
| 0.7736156351791531 | 1 |
| 0.7738870792616721 | 1 |
| 0.7741585233441911 | 1 |
| 0.7744299674267101 | 1 |
| 0.7747014115092291 | 1 |
| 0.7749728555917481 | 1 |
| 0.7752442996742671 | 1 |
| 0.7755157437567861 | 1 |
| 0.7757871878393051 | 1 |
| 0.7760586319218241 | 1 |
| 0.7763300760043431 | 1 |
| 0.7766015200868621 | 1 |
| 0.7768729641693811 | 1 |
| 0.7771444082519001 | 1 |
| 0.7774158523344191 | 1 |
| 0.7776872964169381 | 1 |
| 0.7779587404994571 | 1 |
| 0.7782301845819761 | 1 |
| 0.7785016286644951 | 1 |
| 0.7787730727470141 | 1 |
| 0.7790445168295331 | 1 |
| 0.7793159609120521 | 1 |
| 0.7795874049945711 | 1 |
| 0.7798588490770901 | 1 |
| 0.7801302931596091 | 1 |
| 0.7804017372421281 | 1 |
| 0.7806731813246471 | 1 |
| 0.7809446254071661 | 1 |
| 0.7812160694896851 | 1 |
| 0.7814875135722041 | 1 |
| 0.7817589576547231 | 1 |
| 0.7820304017372421 | 1 |
| 0.7823018458197611 | 1 |
| 0.7825732899022801 | 1 |
| 0.7828447339847991 | 1 |
| 0.7831161780673181 | 1 |
| 0.7833876221498371 | 1 |
| 0.7836590662323561 | 1 |
| 0.7839305103148752 | 1 |
| 0.7842019543973942 | 1 |
| 0.7844733984799132 | 1 |
| 0.7847448425624322 | 1 |
| 0.7850162866449512 | 1 |
| 0.7852877307274702 | 1 |
| 0.7855591748099892 | 1 |
| 0.7858306188925082 | 1 |
| 0.7861020629750272 | 1 |
| 0.7863735070575462 | 1 |
| 0.7866449511400652 | 1 |
| 0.7869163952225842 | 1 |
| 0.7871878393051032 | 1 |
| 0.7874592833876222 | 1 |
| 0.7877307274701412 | 1 |
| 0.7880021715526602 | 1 |
| 0.7882736156351792 | 1 |
| 0.7885450597176982 | 1 |
| 0.7888165038002172 | 1 |
| 0.7890879478827362 | 1 |
| 0.7893593919652552 | 1 |
| 0.7896308360477742 | 1 |
| 0.7899022801302932 | 1 |
| 0.7901737242128122 | 1 |
| 0.7904451682953312 | 1 |
| 0.7907166123778502 | 1 |
| 0.7909880564603692 | 1 |
| 0.7912595005428882 | 1 |
| 0.7915309446254072 | 1 |
| 0.7918023887079262 | 1 |
| 0.7920738327904452 | 1 |
| 0.7923452768729642 | 1 |
| 0.7926167209554832 | 1 |
| 0.7928881650380022 | 1 |
| 0.7931596091205212 | 1 |
| 0.7934310532030402 | 1 |
| 0.7937024972855592 | 1 |
| 0.7939739413680782 | 1 |
| 0.7942453854505972 | 1 |
| 0.7945168295331162 | 1 |
| 0.7947882736156352 | 1 |
| 0.7950597176981542 | 1 |
| 0.7953311617806732 | 1 |
| 0.7956026058631922 | 1 |
| 0.7958740499457112 | 1 |
| 0.7961454940282302 | 1 |
| 0.7964169381107492 | 1 |
| 0.7966883821932682 | 1 |
| 0.7969598262757872 | 1 |
| 0.7972312703583062 | 1 |
| 0.7975027144408252 | 1 |
| 0.7977741585233442 | 1 |
| 0.7980456026058632 | 1 |
| 0.7983170466883822 | 1 |
| 0.7985884907709012 | 1 |
| 0.7988599348534202 | 1 |
| 0.7991313789359392 | 1 |
| 0.7994028230184582 | 1 |
| 0.7996742671009772 | 1 |
| 0.7999457111834962 | 1 |
| 0.8002171552660152 | 1 |
| 0.8004885993485342 | 1 |
| 0.8007600434310532 | 1 |
| 0.8010314875135722 | 1 |
| 0.8013029315960912 | 1 |
| 0.8015743756786102 | 1 |
| 0.8018458197611292 | 1 |
| 0.8021172638436482 | 1 |
| 0.8023887079261672 | 1 |
| 0.8026601520086862 | 1 |
| 0.8029315960912052 | 1 |
| 0.8032030401737242 | 1 |
| 0.8034744842562432 | 1 |
| 0.8037459283387622 | 1 |
| 0.8040173724212812 | 1 |
| 0.8042888165038002 | 1 |
| 0.8045602605863192 | 1 |
| 0.8048317046688382 | 1 |
| 0.8051031487513572 | 1 |
| 0.8053745928338762 | 1 |
| 0.8056460369163952 | 1 |
| 0.8059174809989142 | 1 |
| 0.8061889250814332 | 1 |
| 0.8064603691639523 | 1 |
| 0.8067318132464713 | 1 |
| 0.8070032573289903 | 1 |
| 0.8072747014115093 | 1 |
| 0.8075461454940283 | 1 |
| 0.8078175895765473 | 1 |
| 0.8080890336590663 | 1 |
| 0.8083604777415853 | 1 |
| 0.8086319218241043 | 1 |
| 0.8089033659066233 | 1 |
| 0.8091748099891423 | 1 |
| 0.8094462540716613 | 1 |
| 0.8097176981541803 | 1 |
| 0.8099891422366993 | 1 |
| 0.8102605863192183 | 1 |
| 0.8105320304017373 | 1 |
| 0.8108034744842563 | 1 |
| 0.8110749185667753 | 1 |
| 0.8113463626492943 | 1 |
| 0.8116178067318133 | 1 |
| 0.8118892508143323 | 1 |
| 0.8121606948968513 | 1 |
| 0.8124321389793703 | 1 |
| 0.8127035830618893 | 1 |
| 0.8129750271444083 | 1 |
| 0.8132464712269273 | 1 |
| 0.8135179153094463 | 1 |
| 0.8137893593919653 | 1 |
| 0.8140608034744843 | 1 |
| 0.8143322475570033 | 1 |
| 0.8146036916395223 | 1 |
| 0.8148751357220413 | 1 |
| 0.8151465798045603 | 1 |
| 0.8154180238870793 | 1 |
| 0.8156894679695983 | 1 |
| 0.8159609120521173 | 1 |
| 0.8162323561346363 | 1 |
| 0.8165038002171553 | 1 |
| 0.8167752442996743 | 1 |
| 0.8170466883821933 | 1 |
| 0.8173181324647123 | 1 |
| 0.8175895765472313 | 1 |
| 0.8178610206297503 | 1 |
| 0.8181324647122693 | 1 |
| 0.8184039087947883 | 1 |
| 0.8186753528773073 | 1 |
| 0.8189467969598263 | 1 |
| 0.8192182410423453 | 1 |
| 0.8194896851248643 | 1 |
| 0.8197611292073833 | 1 |
| 0.8200325732899023 | 1 |
| 0.8203040173724213 | 1 |
| 0.8205754614549403 | 1 |
| 0.8208469055374593 | 1 |
| 0.8211183496199783 | 1 |
| 0.8213897937024973 | 1 |
| 0.8216612377850163 | 1 |
| 0.8219326818675353 | 1 |
| 0.8222041259500543 | 1 |
| 0.8224755700325733 | 1 |
| 0.8227470141150923 | 1 |
| 0.8230184581976113 | 1 |
| 0.8232899022801303 | 1 |
| 0.8235613463626493 | 1 |
| 0.8238327904451683 | 1 |
| 0.8241042345276873 | 1 |
| 0.8243756786102063 | 1 |
| 0.8246471226927253 | 1 |
| 0.8249185667752443 | 1 |
| 0.8251900108577633 | 1 |
| 0.8254614549402823 | 1 |
| 0.8257328990228013 | 1 |
| 0.8260043431053203 | 1 |
| 0.8262757871878393 | 1 |
| 0.8265472312703583 | 1 |
| 0.8268186753528773 | 1 |
| 0.8270901194353963 | 1 |
| 0.8273615635179153 | 1 |
| 0.8276330076004343 | 1 |
| 0.8279044516829533 | 1 |
| 0.8281758957654723 | 1 |
| 0.8284473398479913 | 1 |
| 0.8287187839305103 | 1 |
| 0.8289902280130294 | 1 |
| 0.8292616720955484 | 1 |
| 0.8295331161780674 | 1 |
| 0.8298045602605864 | 1 |
| 0.8300760043431054 | 1 |
| 0.8303474484256244 | 1 |
| 0.8306188925081434 | 1 |
| 0.8308903365906624 | 1 |
| 0.8311617806731814 | 1 |
| 0.8314332247557004 | 1 |
| 0.8317046688382194 | 1 |
| 0.8319761129207384 | 1 |
| 0.8322475570032574 | 1 |
| 0.8325190010857764 | 1 |
| 0.8327904451682954 | 1 |
| 0.8330618892508144 | 1 |
| 0.8333333333333334 | 1 |
| 0.8336047774158524 | 1 |
| 0.8338762214983714 | 1 |
| 0.8341476655808904 | 1 |
| 0.8344191096634094 | 1 |
| 0.8346905537459284 | 1 |
| 0.8349619978284474 | 1 |
| 0.8352334419109664 | 1 |
| 0.8355048859934854 | 1 |
| 0.8357763300760044 | 1 |
| 0.8360477741585234 | 1 |
| 0.8363192182410424 | 1 |
| 0.8365906623235614 | 1 |
| 0.8368621064060804 | 1 |
| 0.8371335504885994 | 1 |
| 0.8374049945711184 | 1 |
| 0.8376764386536374 | 1 |
| 0.8379478827361564 | 1 |
| 0.8382193268186754 | 1 |
| 0.8384907709011944 | 1 |
| 0.8387622149837134 | 1 |
| 0.8390336590662324 | 1 |
| 0.8393051031487514 | 1 |
| 0.8395765472312704 | 1 |
| 0.8398479913137894 | 1 |
| 0.8401194353963084 | 1 |
| 0.8403908794788274 | 1 |
| 0.8406623235613464 | 1 |
| 0.8409337676438654 | 1 |
| 0.8412052117263844 | 1 |
| 0.8414766558089034 | 1 |
| 0.8417480998914224 | 1 |
| 0.8420195439739414 | 1 |
| 0.8422909880564604 | 1 |
| 0.8425624321389794 | 1 |
| 0.8428338762214984 | 1 |
| 0.8431053203040174 | 1 |
| 0.8433767643865364 | 1 |
| 0.8436482084690554 | 1 |
| 0.8439196525515744 | 1 |
| 0.8441910966340933 | 1 |
| 0.8444625407166124 | 1 |
| 0.8447339847991313 | 1 |
| 0.8450054288816504 | 1 |
| 0.8452768729641693 | 1 |
| 0.8455483170466884 | 1 |
| 0.8458197611292073 | 1 |
| 0.8460912052117264 | 1 |
| 0.8463626492942453 | 1 |
| 0.8466340933767644 | 1 |
| 0.8469055374592833 | 1 |
| 0.8471769815418024 | 1 |
| 0.8474484256243213 | 1 |
| 0.8477198697068404 | 1 |
| 0.8479913137893593 | 1 |
| 0.8482627578718784 | 1 |
| 0.8485342019543973 | 1 |
| 0.8488056460369164 | 1 |
| 0.8490770901194353 | 1 |
| 0.8493485342019544 | 1 |
| 0.8496199782844733 | 1 |
| 0.8498914223669924 | 1 |
| 0.8501628664495113 | 1 |
| 0.8504343105320304 | 1 |
| 0.8507057546145493 | 1 |
| 0.8509771986970684 | 1 |
| 0.8512486427795873 | 1 |
| 0.8515200868621065 | 1 |
| 0.8517915309446253 | 1 |
| 0.8520629750271445 | 1 |
| 0.8523344191096633 | 1 |
| 0.8526058631921825 | 1 |
| 0.8528773072747013 | 1 |
| 0.8531487513572205 | 1 |
| 0.8534201954397393 | 1 |
| 0.8536916395222585 | 1 |
| 0.8539630836047774 | 1 |
| 0.8542345276872965 | 1 |
| 0.8545059717698154 | 1 |
| 0.8547774158523345 | 1 |
| 0.8550488599348534 | 1 |
| 0.8553203040173725 | 1 |
| 0.8555917480998914 | 1 |
| 0.8558631921824105 | 1 |
| 0.8561346362649294 | 1 |
| 0.8564060803474485 | 1 |
| 0.8566775244299674 | 1 |
| 0.8569489685124865 | 1 |
| 0.8572204125950054 | 1 |
| 0.8574918566775245 | 1 |
| 0.8577633007600434 | 1 |
| 0.8580347448425625 | 1 |
| 0.8583061889250814 | 1 |
| 0.8585776330076005 | 1 |
| 0.8588490770901194 | 1 |
| 0.8591205211726385 | 1 |
| 0.8593919652551574 | 1 |
| 0.8596634093376765 | 1 |
| 0.8599348534201954 | 1 |
| 0.8602062975027145 | 1 |
| 0.8604777415852334 | 1 |
| 0.8607491856677525 | 1 |
| 0.8610206297502714 | 1 |
| 0.8612920738327905 | 1 |
| 0.8615635179153094 | 1 |
| 0.8618349619978285 | 1 |
| 0.8621064060803474 | 1 |
| 0.8623778501628665 | 1 |
| 0.8626492942453854 | 1 |
| 0.8629207383279045 | 1 |
| 0.8631921824104234 | 1 |
| 0.8634636264929425 | 1 |
| 0.8637350705754614 | 1 |
| 0.8640065146579805 | 1 |
| 0.8642779587404994 | 1 |
| 0.8645494028230185 | 1 |
| 0.8648208469055374 | 1 |
| 0.8650922909880565 | 1 |
| 0.8653637350705754 | 1 |
| 0.8656351791530945 | 1 |
| 0.8659066232356134 | 1 |
| 0.8661780673181325 | 1 |
| 0.8664495114006514 | 1 |
| 0.8667209554831705 | 1 |
| 0.8669923995656894 | 1 |
| 0.8672638436482085 | 1 |
| 0.8675352877307274 | 1 |
| 0.8678067318132465 | 1 |
| 0.8680781758957654 | 1 |
| 0.8683496199782845 | 1 |
| 0.8686210640608034 | 1 |
| 0.8688925081433225 | 1 |
| 0.8691639522258414 | 1 |
| 0.8694353963083605 | 1 |
| 0.8697068403908794 | 1 |
| 0.8699782844733985 | 1 |
| 0.8702497285559174 | 1 |
| 0.8705211726384365 | 1 |
| 0.8707926167209554 | 1 |
| 0.8710640608034745 | 1 |
| 0.8713355048859934 | 1 |
| 0.8716069489685125 | 1 |
| 0.8718783930510314 | 1 |
| 0.8721498371335505 | 1 |
| 0.8724212812160694 | 1 |
| 0.8726927252985885 | 1 |
| 0.8729641693811074 | 1 |
| 0.8732356134636265 | 1 |
| 0.8735070575461454 | 1 |
| 0.8737785016286646 | 1 |
| 0.8740499457111834 | 1 |
| 0.8743213897937026 | 1 |
| 0.8745928338762214 | 1 |
| 0.8748642779587406 | 1 |
| 0.8751357220412594 | 1 |
| 0.8754071661237786 | 1 |
| 0.8756786102062974 | 1 |
| 0.8759500542888166 | 1 |
| 0.8762214983713354 | 1 |
| 0.8764929424538546 | 1 |
| 0.8767643865363735 | 1 |
| 0.8770358306188926 | 1 |
| 0.8773072747014115 | 1 |
| 0.8775787187839306 | 1 |
| 0.8778501628664495 | 1 |
| 0.8781216069489686 | 1 |
| 0.8783930510314875 | 1 |
| 0.8786644951140066 | 1 |
| 0.8789359391965255 | 1 |
| 0.8792073832790446 | 1 |
| 0.8794788273615635 | 1 |
| 0.8797502714440826 | 1 |
| 0.8800217155266015 | 1 |
| 0.8802931596091206 | 1 |
| 0.8805646036916395 | 1 |
| 0.8808360477741586 | 1 |
| 0.8811074918566775 | 1 |
| 0.8813789359391966 | 1 |
| 0.8816503800217155 | 1 |
| 0.8819218241042346 | 1 |
| 0.8821932681867535 | 1 |
| 0.8824647122692726 | 1 |
| 0.8827361563517915 | 1 |
| 0.8830076004343106 | 1 |
| 0.8832790445168295 | 1 |
| 0.8835504885993486 | 1 |
| 0.8838219326818675 | 1 |
| 0.8840933767643866 | 1 |
| 0.8843648208469055 | 1 |
| 0.8846362649294246 | 1 |
| 0.8849077090119435 | 1 |
| 0.8851791530944626 | 1 |
| 0.8854505971769815 | 1 |
| 0.8857220412595006 | 1 |
| 0.8859934853420195 | 1 |
| 0.8862649294245386 | 1 |
| 0.8865363735070575 | 1 |
| 0.8868078175895766 | 1 |
| 0.8870792616720955 | 1 |
| 0.8873507057546146 | 1 |
| 0.8876221498371335 | 1 |
| 0.8878935939196526 | 1 |
| 0.8881650380021715 | 1 |
| 0.8884364820846906 | 1 |
| 0.8887079261672095 | 1 |
| 0.8889793702497286 | 1 |
| 0.8892508143322475 | 1 |
| 0.8895222584147666 | 1 |
| 0.8897937024972855 | 1 |
| 0.8900651465798046 | 1 |
| 0.8903365906623235 | 1 |
| 0.8906080347448426 | 1 |
| 0.8908794788273615 | 1 |
| 0.8911509229098805 | 1 |
| 0.8914223669923995 | 1 |
| 0.8916938110749185 | 1 |
| 0.8919652551574375 | 1 |
| 0.8922366992399565 | 1 |
| 0.8925081433224755 | 1 |
| 0.8927795874049945 | 1 |
| 0.8930510314875135 | 1 |
| 0.8933224755700325 | 1 |
| 0.8935939196525515 | 1 |
| 0.8938653637350705 | 1 |
| 0.8941368078175895 | 1 |
| 0.8944082519001085 | 1 |
| 0.8946796959826275 | 1 |
| 0.8949511400651465 | 1 |
| 0.8952225841476655 | 1 |
| 0.8954940282301845 | 1 |
| 0.8957654723127035 | 1 |
| 0.8960369163952225 | 1 |
| 0.8963083604777415 | 1 |
| 0.8965798045602605 | 1 |
| 0.8968512486427795 | 1 |
| 0.8971226927252985 | 1 |
| 0.8973941368078175 | 1 |
| 0.8976655808903365 | 1 |
| 0.8979370249728555 | 1 |
| 0.8982084690553745 | 1 |
| 0.8984799131378935 | 1 |
| 0.8987513572204126 | 1 |
| 0.8990228013029316 | 1 |
| 0.8992942453854506 | 1 |
| 0.8995656894679696 | 1 |
| 0.8998371335504886 | 1 |
| 0.9001085776330076 | 1 |
| 0.9003800217155266 | 1 |
| 0.9006514657980456 | 1 |
| 0.9009229098805646 | 1 |
| 0.9011943539630836 | 1 |
| 0.9014657980456026 | 1 |
| 0.9017372421281216 | 1 |
| 0.9020086862106406 | 1 |
| 0.9022801302931596 | 1 |
| 0.9025515743756786 | 1 |
| 0.9028230184581976 | 1 |
| 0.9030944625407166 | 1 |
| 0.9033659066232356 | 1 |
| 0.9036373507057546 | 1 |
| 0.9039087947882736 | 1 |
| 0.9041802388707926 | 1 |
| 0.9044516829533116 | 1 |
| 0.9047231270358306 | 1 |
| 0.9049945711183496 | 1 |
| 0.9052660152008686 | 1 |
| 0.9055374592833876 | 1 |
| 0.9058089033659066 | 1 |
| 0.9060803474484256 | 1 |
| 0.9063517915309446 | 1 |
| 0.9066232356134636 | 1 |
| 0.9068946796959826 | 1 |
| 0.9071661237785016 | 1 |
| 0.9074375678610206 | 1 |
| 0.9077090119435396 | 1 |
| 0.9079804560260586 | 1 |
| 0.9082519001085776 | 1 |
| 0.9085233441910966 | 1 |
| 0.9087947882736156 | 1 |
| 0.9090662323561346 | 1 |
| 0.9093376764386536 | 1 |
| 0.9096091205211726 | 1 |
| 0.9098805646036916 | 1 |
| 0.9101520086862106 | 1 |
| 0.9104234527687296 | 1 |
| 0.9106948968512486 | 1 |
| 0.9109663409337676 | 1 |
| 0.9112377850162866 | 1 |
| 0.9115092290988056 | 1 |
| 0.9117806731813246 | 1 |
| 0.9120521172638436 | 1 |
| 0.9123235613463626 | 1 |
| 0.9125950054288816 | 1 |
| 0.9128664495114006 | 1 |
| 0.9131378935939196 | 1 |
| 0.9134093376764386 | 1 |
| 0.9136807817589576 | 1 |
| 0.9139522258414766 | 1 |
| 0.9142236699239956 | 1 |
| 0.9144951140065146 | 1 |
| 0.9147665580890336 | 1 |
| 0.9150380021715526 | 1 |
| 0.9153094462540716 | 1 |
| 0.9155808903365906 | 1 |
| 0.9158523344191096 | 1 |
| 0.9161237785016286 | 1 |
| 0.9163952225841476 | 1 |
| 0.9166666666666666 | 1 |
| 0.9169381107491856 | 1 |
| 0.9172095548317046 | 1 |
| 0.9174809989142236 | 1 |
| 0.9177524429967426 | 1 |
| 0.9180238870792616 | 1 |
| 0.9182953311617806 | 1 |
| 0.9185667752442996 | 1 |
| 0.9188382193268186 | 1 |
| 0.9191096634093376 | 1 |
| 0.9193811074918566 | 1 |
| 0.9196525515743756 | 1 |
| 0.9199239956568946 | 1 |
| 0.9201954397394136 | 1 |
| 0.9204668838219326 | 1 |
| 0.9207383279044516 | 1 |
| 0.9210097719869706 | 1 |
| 0.9212812160694897 | 1 |
| 0.9215526601520087 | 1 |
| 0.9218241042345277 | 1 |
| 0.9220955483170467 | 1 |
| 0.9223669923995657 | 1 |
| 0.9226384364820847 | 1 |
| 0.9229098805646037 | 1 |
| 0.9231813246471227 | 1 |
| 0.9234527687296417 | 1 |
| 0.9237242128121607 | 1 |
| 0.9239956568946797 | 1 |
| 0.9242671009771987 | 1 |
| 0.9245385450597177 | 1 |
| 0.9248099891422367 | 1 |
| 0.9250814332247557 | 1 |
| 0.9253528773072747 | 1 |
| 0.9256243213897937 | 1 |
| 0.9258957654723127 | 1 |
| 0.9261672095548317 | 1 |
| 0.9264386536373507 | 1 |
| 0.9267100977198697 | 1 |
| 0.9269815418023887 | 1 |
| 0.9272529858849077 | 1 |
| 0.9275244299674267 | 1 |
| 0.9277958740499457 | 1 |
| 0.9280673181324647 | 1 |
| 0.9283387622149837 | 1 |
| 0.9286102062975027 | 1 |
| 0.9288816503800217 | 1 |
| 0.9291530944625407 | 1 |
| 0.9294245385450597 | 1 |
| 0.9296959826275787 | 1 |
| 0.9299674267100977 | 1 |
| 0.9302388707926167 | 1 |
| 0.9305103148751357 | 1 |
| 0.9307817589576547 | 1 |
| 0.9310532030401737 | 1 |
| 0.9313246471226927 | 1 |
| 0.9315960912052117 | 1 |
| 0.9318675352877307 | 1 |
| 0.9321389793702497 | 1 |
| 0.9324104234527687 | 1 |
| 0.9326818675352877 | 1 |
| 0.9329533116178067 | 1 |
| 0.9332247557003257 | 1 |
| 0.9334961997828447 | 1 |
| 0.9337676438653637 | 1 |
| 0.9340390879478827 | 1 |
| 0.9343105320304017 | 1 |
| 0.9345819761129207 | 1 |
| 0.9348534201954397 | 1 |
| 0.9351248642779587 | 1 |
| 0.9353963083604777 | 1 |
| 0.9356677524429967 | 1 |
| 0.9359391965255157 | 1 |
| 0.9362106406080347 | 1 |
| 0.9364820846905537 | 1 |
| 0.9367535287730727 | 1 |
| 0.9370249728555917 | 1 |
| 0.9372964169381107 | 1 |
| 0.9375678610206297 | 1 |
| 0.9378393051031487 | 1 |
| 0.9381107491856677 | 1 |
| 0.9383821932681867 | 1 |
| 0.9386536373507057 | 1 |
| 0.9389250814332247 | 1 |
| 0.9391965255157437 | 1 |
| 0.9394679695982627 | 1 |
| 0.9397394136807817 | 1 |
| 0.9400108577633007 | 1 |
| 0.9402823018458197 | 1 |
| 0.9405537459283387 | 1 |
| 0.9408251900108577 | 1 |
| 0.9410966340933767 | 1 |
| 0.9413680781758957 | 1 |
| 0.9416395222584147 | 1 |
| 0.9419109663409337 | 1 |
| 0.9421824104234527 | 1 |
| 0.9424538545059717 | 1 |
| 0.9427252985884907 | 1 |
| 0.9429967426710097 | 1 |
| 0.9432681867535287 | 1 |
| 0.9435396308360477 | 1 |
| 0.9438110749185668 | 1 |
| 0.9440825190010858 | 1 |
| 0.9443539630836048 | 1 |
| 0.9446254071661238 | 1 |
| 0.9448968512486428 | 1 |
| 0.9451682953311618 | 1 |
| 0.9454397394136808 | 1 |
| 0.9457111834961998 | 1 |
| 0.9459826275787188 | 1 |
| 0.9462540716612378 | 1 |
| 0.9465255157437568 | 1 |
| 0.9467969598262758 | 1 |
| 0.9470684039087948 | 1 |
| 0.9473398479913138 | 1 |
| 0.9476112920738328 | 1 |
| 0.9478827361563518 | 1 |
| 0.9481541802388708 | 1 |
| 0.9484256243213898 | 1 |
| 0.9486970684039088 | 1 |
| 0.9489685124864278 | 1 |
| 0.9492399565689468 | 1 |
| 0.9495114006514658 | 1 |
| 0.9497828447339848 | 1 |
| 0.9500542888165038 | 1 |
| 0.9503257328990228 | 1 |
| 0.9505971769815418 | 1 |
| 0.9508686210640608 | 1 |
| 0.9511400651465798 | 1 |
| 0.9514115092290988 | 1 |
| 0.9516829533116178 | 1 |
| 0.9519543973941368 | 1 |
| 0.9522258414766558 | 1 |
| 0.9524972855591748 | 1 |
| 0.9527687296416938 | 1 |
| 0.9530401737242128 | 1 |
| 0.9533116178067318 | 1 |
| 0.9535830618892508 | 1 |
| 0.9538545059717698 | 1 |
| 0.9541259500542888 | 1 |
| 0.9543973941368078 | 1 |
| 0.9546688382193268 | 1 |
| 0.9549402823018458 | 1 |
| 0.9552117263843648 | 1 |
| 0.9554831704668838 | 1 |
| 0.9557546145494028 | 1 |
| 0.9560260586319218 | 1 |
| 0.9562975027144408 | 1 |
| 0.9565689467969598 | 1 |
| 0.9568403908794788 | 1 |
| 0.9571118349619978 | 1 |
| 0.9573832790445168 | 1 |
| 0.9576547231270358 | 1 |
| 0.9579261672095548 | 1 |
| 0.9581976112920738 | 1 |
| 0.9584690553745928 | 1 |
| 0.9587404994571118 | 1 |
| 0.9590119435396308 | 1 |
| 0.9592833876221498 | 1 |
| 0.9595548317046688 | 1 |
| 0.9598262757871878 | 1 |
| 0.9600977198697068 | 1 |
| 0.9603691639522258 | 1 |
| 0.9606406080347448 | 1 |
| 0.9609120521172638 | 1 |
| 0.9611834961997828 | 1 |
| 0.9614549402823018 | 1 |
| 0.9617263843648208 | 1 |
| 0.9619978284473398 | 1 |
| 0.9622692725298588 | 1 |
| 0.9625407166123778 | 1 |
| 0.9628121606948968 | 1 |
| 0.9630836047774158 | 1 |
| 0.9633550488599348 | 1 |
| 0.9636264929424538 | 1 |
| 0.9638979370249728 | 1 |
| 0.9641693811074918 | 1 |
| 0.9644408251900108 | 1 |
| 0.9647122692725298 | 1 |
| 0.9649837133550488 | 1 |
| 0.9652551574375678 | 1 |
| 0.9655266015200868 | 1 |
| 0.9657980456026058 | 1 |
| 0.9660694896851248 | 1 |
| 0.9663409337676439 | 1 |
| 0.9666123778501629 | 1 |
| 0.9668838219326819 | 1 |
| 0.9671552660152009 | 1 |
| 0.9674267100977199 | 1 |
| 0.9676981541802389 | 1 |
| 0.9679695982627579 | 1 |
| 0.9682410423452769 | 1 |
| 0.9685124864277959 | 1 |
| 0.9687839305103149 | 1 |
| 0.9690553745928339 | 1 |
| 0.9693268186753529 | 1 |
| 0.9695982627578719 | 1 |
| 0.9698697068403909 | 1 |
| 0.9701411509229099 | 1 |
| 0.9704125950054289 | 1 |
| 0.9706840390879479 | 1 |
| 0.9709554831704669 | 1 |
| 0.9712269272529859 | 1 |
| 0.9714983713355049 | 1 |
| 0.9717698154180239 | 1 |
| 0.9720412595005429 | 1 |
| 0.9723127035830619 | 1 |
| 0.9725841476655809 | 1 |
| 0.9728555917480999 | 1 |
| 0.9731270358306189 | 1 |
| 0.9733984799131379 | 1 |
| 0.9736699239956569 | 1 |
| 0.9739413680781759 | 1 |
| 0.9742128121606949 | 1 |
| 0.9744842562432139 | 1 |
| 0.9747557003257329 | 1 |
| 0.9750271444082519 | 1 |
| 0.9752985884907709 | 1 |
| 0.9755700325732899 | 1 |
| 0.9758414766558089 | 1 |
| 0.9761129207383279 | 1 |
| 0.9763843648208469 | 1 |
| 0.9766558089033659 | 1 |
| 0.9769272529858849 | 1 |
| 0.9771986970684039 | 1 |
| 0.9774701411509229 | 1 |
| 0.9777415852334419 | 1 |
| 0.9780130293159609 | 1 |
| 0.9782844733984799 | 1 |
| 0.9785559174809989 | 1 |
| 0.9788273615635179 | 1 |
| 0.9790988056460369 | 1 |
| 0.9793702497285559 | 1 |
| 0.9796416938110749 | 1 |
| 0.9799131378935939 | 1 |
| 0.9801845819761129 | 1 |
| 0.9804560260586319 | 1 |
| 0.9807274701411509 | 1 |
| 0.9809989142236699 | 1 |
| 0.9812703583061889 | 1 |
| 0.9815418023887079 | 1 |
| 0.9818132464712269 | 1 |
| 0.9820846905537459 | 1 |
| 0.9823561346362649 | 1 |
| 0.9826275787187839 | 1 |
| 0.9828990228013029 | 1 |
| 0.9831704668838219 | 1 |
| 0.9834419109663409 | 1 |
| 0.9837133550488599 | 1 |
| 0.9839847991313789 | 1 |
| 0.9842562432138979 | 1 |
| 0.9845276872964169 | 1 |
| 0.9847991313789359 | 1 |
| 0.9850705754614549 | 1 |
| 0.9853420195439739 | 1 |
| 0.9856134636264929 | 1 |
| 0.9858849077090119 | 1 |
| 0.9861563517915309 | 1 |
| 0.9864277958740499 | 1 |
| 0.9866992399565689 | 1 |
| 0.9869706840390879 | 1 |
| 0.9872421281216069 | 1 |
| 0.987513572204126 | 1 |
| 0.987785016286645 | 1 |
| 0.988056460369164 | 1 |
| 0.988327904451683 | 1 |
| 0.988599348534202 | 1 |
| 0.988870792616721 | 1 |
| 0.98914223669924 | 1 |
| 0.989413680781759 | 1 |
| 0.989685124864278 | 1 |
| 0.989956568946797 | 1 |
| 0.990228013029316 | 1 |
| 0.990499457111835 | 1 |
| 0.990770901194354 | 1 |
| 0.991042345276873 | 1 |
| 0.991313789359392 | 1 |
| 0.991585233441911 | 1 |
| 0.99185667752443 | 1 |
| 0.992128121606949 | 1 |
| 0.992399565689468 | 1 |
| 0.992671009771987 | 1 |
| 0.992942453854506 | 1 |
| 0.993213897937025 | 1 |
| 0.993485342019544 | 1 |
| 0.993756786102063 | 1 |
| 0.994028230184582 | 1 |
| 0.994299674267101 | 1 |
| 0.99457111834962 | 1 |
| 0.994842562432139 | 1 |
| 0.995114006514658 | 1 |
| 0.995385450597177 | 1 |
| 0.995656894679696 | 1 |
| 0.995928338762215 | 1 |
| 0.996199782844734 | 1 |
| 0.996471226927253 | 1 |
| 0.996742671009772 | 1 |
| 0.997014115092291 | 1 |
| 0.99728555917481 | 1 |
| 0.997557003257329 | 1 |
| 0.997828447339848 | 1 |
| 0.998099891422367 | 1 |
| 0.998371335504886 | 1 |
| 0.998642779587405 | 1 |
| 0.998914223669924 | 1 |
| 0.999185667752443 | 1 |
| 0.999457111834962 | 1 |
| 0.999728555917481 | 1 |